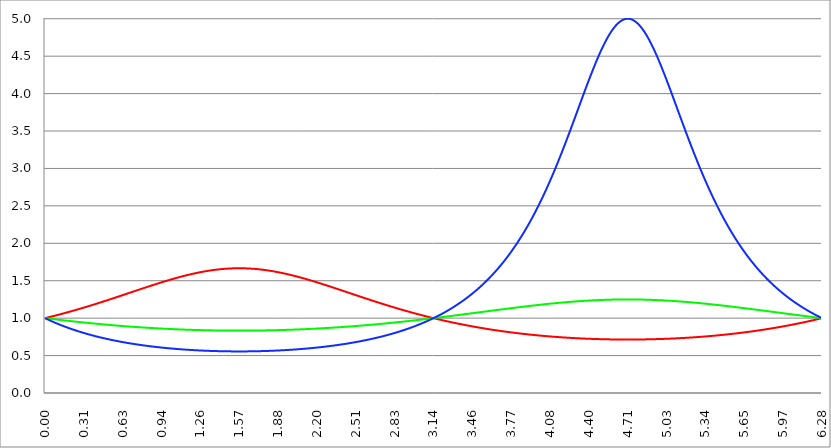
| Category | Series 1 | Series 0 | Series 2 |
|---|---|---|---|
| 0.0 | 1 | 1 | 1 |
| 0.00314159265358979 | 1.001 | 0.999 | 0.997 |
| 0.00628318530717958 | 1.003 | 0.999 | 0.995 |
| 0.00942477796076938 | 1.004 | 0.998 | 0.993 |
| 0.0125663706143592 | 1.005 | 0.997 | 0.99 |
| 0.015707963267949 | 1.006 | 0.997 | 0.988 |
| 0.0188495559215388 | 1.008 | 0.996 | 0.985 |
| 0.0219911485751285 | 1.009 | 0.996 | 0.983 |
| 0.0251327412287183 | 1.01 | 0.995 | 0.98 |
| 0.0282743338823081 | 1.011 | 0.994 | 0.978 |
| 0.0314159265358979 | 1.013 | 0.994 | 0.975 |
| 0.0345575191894877 | 1.014 | 0.993 | 0.973 |
| 0.0376991118430775 | 1.015 | 0.993 | 0.971 |
| 0.0408407044966673 | 1.017 | 0.992 | 0.968 |
| 0.0439822971502571 | 1.018 | 0.991 | 0.966 |
| 0.0471238898038469 | 1.019 | 0.991 | 0.964 |
| 0.0502654824574367 | 1.021 | 0.99 | 0.961 |
| 0.0534070751110265 | 1.022 | 0.989 | 0.959 |
| 0.0565486677646163 | 1.023 | 0.989 | 0.957 |
| 0.059690260418206 | 1.024 | 0.988 | 0.954 |
| 0.0628318530717958 | 1.026 | 0.988 | 0.952 |
| 0.0659734457253856 | 1.027 | 0.987 | 0.95 |
| 0.0691150383789754 | 1.028 | 0.986 | 0.948 |
| 0.0722566310325652 | 1.03 | 0.986 | 0.945 |
| 0.075398223686155 | 1.031 | 0.985 | 0.943 |
| 0.0785398163397448 | 1.032 | 0.985 | 0.941 |
| 0.0816814089933346 | 1.034 | 0.984 | 0.939 |
| 0.0848230016469244 | 1.035 | 0.983 | 0.937 |
| 0.0879645943005142 | 1.036 | 0.983 | 0.934 |
| 0.091106186954104 | 1.038 | 0.982 | 0.932 |
| 0.0942477796076937 | 1.039 | 0.982 | 0.93 |
| 0.0973893722612835 | 1.04 | 0.981 | 0.928 |
| 0.100530964914873 | 1.042 | 0.98 | 0.926 |
| 0.103672557568463 | 1.043 | 0.98 | 0.924 |
| 0.106814150222053 | 1.045 | 0.979 | 0.921 |
| 0.109955742875643 | 1.046 | 0.979 | 0.919 |
| 0.113097335529233 | 1.047 | 0.978 | 0.917 |
| 0.116238928182822 | 1.049 | 0.977 | 0.915 |
| 0.119380520836412 | 1.05 | 0.977 | 0.913 |
| 0.122522113490002 | 1.051 | 0.976 | 0.911 |
| 0.125663706143592 | 1.053 | 0.976 | 0.909 |
| 0.128805298797181 | 1.054 | 0.975 | 0.907 |
| 0.131946891450771 | 1.056 | 0.974 | 0.905 |
| 0.135088484104361 | 1.057 | 0.974 | 0.903 |
| 0.138230076757951 | 1.058 | 0.973 | 0.901 |
| 0.141371669411541 | 1.06 | 0.973 | 0.899 |
| 0.14451326206513 | 1.061 | 0.972 | 0.897 |
| 0.14765485471872 | 1.063 | 0.971 | 0.895 |
| 0.15079644737231 | 1.064 | 0.971 | 0.893 |
| 0.1539380400259 | 1.065 | 0.97 | 0.891 |
| 0.15707963267949 | 1.067 | 0.97 | 0.889 |
| 0.160221225333079 | 1.068 | 0.969 | 0.887 |
| 0.163362817986669 | 1.07 | 0.968 | 0.885 |
| 0.166504410640259 | 1.071 | 0.968 | 0.883 |
| 0.169646003293849 | 1.072 | 0.967 | 0.881 |
| 0.172787595947439 | 1.074 | 0.967 | 0.879 |
| 0.175929188601028 | 1.075 | 0.966 | 0.877 |
| 0.179070781254618 | 1.077 | 0.966 | 0.875 |
| 0.182212373908208 | 1.078 | 0.965 | 0.873 |
| 0.185353966561798 | 1.08 | 0.964 | 0.872 |
| 0.188495559215388 | 1.081 | 0.964 | 0.87 |
| 0.191637151868977 | 1.082 | 0.963 | 0.868 |
| 0.194778744522567 | 1.084 | 0.963 | 0.866 |
| 0.197920337176157 | 1.085 | 0.962 | 0.864 |
| 0.201061929829747 | 1.087 | 0.962 | 0.862 |
| 0.204203522483336 | 1.088 | 0.961 | 0.86 |
| 0.207345115136926 | 1.09 | 0.96 | 0.859 |
| 0.210486707790516 | 1.091 | 0.96 | 0.857 |
| 0.213628300444106 | 1.093 | 0.959 | 0.855 |
| 0.216769893097696 | 1.094 | 0.959 | 0.853 |
| 0.219911485751285 | 1.096 | 0.958 | 0.851 |
| 0.223053078404875 | 1.097 | 0.958 | 0.85 |
| 0.226194671058465 | 1.099 | 0.957 | 0.848 |
| 0.229336263712055 | 1.1 | 0.957 | 0.846 |
| 0.232477856365645 | 1.102 | 0.956 | 0.844 |
| 0.235619449019234 | 1.103 | 0.955 | 0.843 |
| 0.238761041672824 | 1.104 | 0.955 | 0.841 |
| 0.241902634326414 | 1.106 | 0.954 | 0.839 |
| 0.245044226980004 | 1.107 | 0.954 | 0.837 |
| 0.248185819633594 | 1.109 | 0.953 | 0.836 |
| 0.251327412287183 | 1.11 | 0.953 | 0.834 |
| 0.254469004940773 | 1.112 | 0.952 | 0.832 |
| 0.257610597594363 | 1.113 | 0.952 | 0.831 |
| 0.260752190247953 | 1.115 | 0.951 | 0.829 |
| 0.263893782901543 | 1.116 | 0.95 | 0.827 |
| 0.267035375555132 | 1.118 | 0.95 | 0.826 |
| 0.270176968208722 | 1.12 | 0.949 | 0.824 |
| 0.273318560862312 | 1.121 | 0.949 | 0.822 |
| 0.276460153515902 | 1.123 | 0.948 | 0.821 |
| 0.279601746169492 | 1.124 | 0.948 | 0.819 |
| 0.282743338823082 | 1.126 | 0.947 | 0.818 |
| 0.285884931476671 | 1.127 | 0.947 | 0.816 |
| 0.289026524130261 | 1.129 | 0.946 | 0.814 |
| 0.292168116783851 | 1.13 | 0.946 | 0.813 |
| 0.295309709437441 | 1.132 | 0.945 | 0.811 |
| 0.298451302091031 | 1.133 | 0.944 | 0.81 |
| 0.30159289474462 | 1.135 | 0.944 | 0.808 |
| 0.30473448739821 | 1.136 | 0.943 | 0.806 |
| 0.3078760800518 | 1.138 | 0.943 | 0.805 |
| 0.31101767270539 | 1.139 | 0.942 | 0.803 |
| 0.31415926535898 | 1.141 | 0.942 | 0.802 |
| 0.31730085801257 | 1.143 | 0.941 | 0.8 |
| 0.320442450666159 | 1.144 | 0.941 | 0.799 |
| 0.323584043319749 | 1.146 | 0.94 | 0.797 |
| 0.326725635973339 | 1.147 | 0.94 | 0.796 |
| 0.329867228626929 | 1.149 | 0.939 | 0.794 |
| 0.333008821280519 | 1.15 | 0.939 | 0.793 |
| 0.336150413934108 | 1.152 | 0.938 | 0.791 |
| 0.339292006587698 | 1.154 | 0.938 | 0.79 |
| 0.342433599241288 | 1.155 | 0.937 | 0.788 |
| 0.345575191894878 | 1.157 | 0.937 | 0.787 |
| 0.348716784548468 | 1.158 | 0.936 | 0.785 |
| 0.351858377202058 | 1.16 | 0.936 | 0.784 |
| 0.354999969855647 | 1.161 | 0.935 | 0.782 |
| 0.358141562509237 | 1.163 | 0.934 | 0.781 |
| 0.361283155162827 | 1.165 | 0.934 | 0.78 |
| 0.364424747816417 | 1.166 | 0.933 | 0.778 |
| 0.367566340470007 | 1.168 | 0.933 | 0.777 |
| 0.370707933123597 | 1.169 | 0.932 | 0.775 |
| 0.373849525777186 | 1.171 | 0.932 | 0.774 |
| 0.376991118430776 | 1.173 | 0.931 | 0.772 |
| 0.380132711084366 | 1.174 | 0.931 | 0.771 |
| 0.383274303737956 | 1.176 | 0.93 | 0.77 |
| 0.386415896391546 | 1.178 | 0.93 | 0.768 |
| 0.389557489045135 | 1.179 | 0.929 | 0.767 |
| 0.392699081698725 | 1.181 | 0.929 | 0.766 |
| 0.395840674352315 | 1.182 | 0.928 | 0.764 |
| 0.398982267005905 | 1.184 | 0.928 | 0.763 |
| 0.402123859659495 | 1.186 | 0.927 | 0.762 |
| 0.405265452313085 | 1.187 | 0.927 | 0.76 |
| 0.408407044966674 | 1.189 | 0.926 | 0.759 |
| 0.411548637620264 | 1.19 | 0.926 | 0.758 |
| 0.414690230273854 | 1.192 | 0.925 | 0.756 |
| 0.417831822927444 | 1.194 | 0.925 | 0.755 |
| 0.420973415581034 | 1.195 | 0.924 | 0.754 |
| 0.424115008234623 | 1.197 | 0.924 | 0.752 |
| 0.427256600888213 | 1.199 | 0.923 | 0.751 |
| 0.430398193541803 | 1.2 | 0.923 | 0.75 |
| 0.433539786195393 | 1.202 | 0.922 | 0.748 |
| 0.436681378848983 | 1.204 | 0.922 | 0.747 |
| 0.439822971502573 | 1.205 | 0.922 | 0.746 |
| 0.442964564156162 | 1.207 | 0.921 | 0.745 |
| 0.446106156809752 | 1.209 | 0.921 | 0.743 |
| 0.449247749463342 | 1.21 | 0.92 | 0.742 |
| 0.452389342116932 | 1.212 | 0.92 | 0.741 |
| 0.455530934770522 | 1.214 | 0.919 | 0.74 |
| 0.458672527424111 | 1.215 | 0.919 | 0.738 |
| 0.461814120077701 | 1.217 | 0.918 | 0.737 |
| 0.464955712731291 | 1.219 | 0.918 | 0.736 |
| 0.468097305384881 | 1.22 | 0.917 | 0.735 |
| 0.471238898038471 | 1.222 | 0.917 | 0.734 |
| 0.474380490692061 | 1.224 | 0.916 | 0.732 |
| 0.47752208334565 | 1.225 | 0.916 | 0.731 |
| 0.48066367599924 | 1.227 | 0.915 | 0.73 |
| 0.48380526865283 | 1.229 | 0.915 | 0.729 |
| 0.48694686130642 | 1.23 | 0.914 | 0.728 |
| 0.49008845396001 | 1.232 | 0.914 | 0.726 |
| 0.493230046613599 | 1.234 | 0.913 | 0.725 |
| 0.496371639267189 | 1.235 | 0.913 | 0.724 |
| 0.499513231920779 | 1.237 | 0.913 | 0.723 |
| 0.502654824574369 | 1.239 | 0.912 | 0.722 |
| 0.505796417227959 | 1.24 | 0.912 | 0.721 |
| 0.508938009881549 | 1.242 | 0.911 | 0.72 |
| 0.512079602535138 | 1.244 | 0.911 | 0.718 |
| 0.515221195188728 | 1.245 | 0.91 | 0.717 |
| 0.518362787842318 | 1.247 | 0.91 | 0.716 |
| 0.521504380495908 | 1.249 | 0.909 | 0.715 |
| 0.524645973149498 | 1.251 | 0.909 | 0.714 |
| 0.527787565803087 | 1.252 | 0.908 | 0.713 |
| 0.530929158456677 | 1.254 | 0.908 | 0.712 |
| 0.534070751110267 | 1.256 | 0.908 | 0.711 |
| 0.537212343763857 | 1.257 | 0.907 | 0.71 |
| 0.540353936417447 | 1.259 | 0.907 | 0.708 |
| 0.543495529071037 | 1.261 | 0.906 | 0.707 |
| 0.546637121724626 | 1.263 | 0.906 | 0.706 |
| 0.549778714378216 | 1.264 | 0.905 | 0.705 |
| 0.552920307031806 | 1.266 | 0.905 | 0.704 |
| 0.556061899685396 | 1.268 | 0.905 | 0.703 |
| 0.559203492338986 | 1.269 | 0.904 | 0.702 |
| 0.562345084992576 | 1.271 | 0.904 | 0.701 |
| 0.565486677646165 | 1.273 | 0.903 | 0.7 |
| 0.568628270299755 | 1.275 | 0.903 | 0.699 |
| 0.571769862953345 | 1.276 | 0.902 | 0.698 |
| 0.574911455606935 | 1.278 | 0.902 | 0.697 |
| 0.578053048260525 | 1.28 | 0.901 | 0.696 |
| 0.581194640914114 | 1.281 | 0.901 | 0.695 |
| 0.584336233567704 | 1.283 | 0.901 | 0.694 |
| 0.587477826221294 | 1.285 | 0.9 | 0.693 |
| 0.590619418874884 | 1.287 | 0.9 | 0.692 |
| 0.593761011528474 | 1.288 | 0.899 | 0.691 |
| 0.596902604182064 | 1.29 | 0.899 | 0.69 |
| 0.600044196835653 | 1.292 | 0.899 | 0.689 |
| 0.603185789489243 | 1.294 | 0.898 | 0.688 |
| 0.606327382142833 | 1.295 | 0.898 | 0.687 |
| 0.609468974796423 | 1.297 | 0.897 | 0.686 |
| 0.612610567450013 | 1.299 | 0.897 | 0.685 |
| 0.615752160103602 | 1.3 | 0.896 | 0.684 |
| 0.618893752757192 | 1.302 | 0.896 | 0.683 |
| 0.622035345410782 | 1.304 | 0.896 | 0.682 |
| 0.625176938064372 | 1.306 | 0.895 | 0.681 |
| 0.628318530717962 | 1.307 | 0.895 | 0.68 |
| 0.631460123371551 | 1.309 | 0.894 | 0.679 |
| 0.634601716025141 | 1.311 | 0.894 | 0.678 |
| 0.637743308678731 | 1.313 | 0.894 | 0.677 |
| 0.640884901332321 | 1.314 | 0.893 | 0.676 |
| 0.644026493985911 | 1.316 | 0.893 | 0.676 |
| 0.647168086639501 | 1.318 | 0.892 | 0.675 |
| 0.65030967929309 | 1.32 | 0.892 | 0.674 |
| 0.65345127194668 | 1.321 | 0.892 | 0.673 |
| 0.65659286460027 | 1.323 | 0.891 | 0.672 |
| 0.65973445725386 | 1.325 | 0.891 | 0.671 |
| 0.66287604990745 | 1.327 | 0.89 | 0.67 |
| 0.666017642561039 | 1.328 | 0.89 | 0.669 |
| 0.669159235214629 | 1.33 | 0.89 | 0.668 |
| 0.672300827868219 | 1.332 | 0.889 | 0.667 |
| 0.675442420521809 | 1.334 | 0.889 | 0.667 |
| 0.678584013175399 | 1.335 | 0.888 | 0.666 |
| 0.681725605828989 | 1.337 | 0.888 | 0.665 |
| 0.684867198482578 | 1.339 | 0.888 | 0.664 |
| 0.688008791136168 | 1.34 | 0.887 | 0.663 |
| 0.691150383789758 | 1.342 | 0.887 | 0.662 |
| 0.694291976443348 | 1.344 | 0.887 | 0.661 |
| 0.697433569096938 | 1.346 | 0.886 | 0.661 |
| 0.700575161750528 | 1.347 | 0.886 | 0.66 |
| 0.703716754404117 | 1.349 | 0.885 | 0.659 |
| 0.706858347057707 | 1.351 | 0.885 | 0.658 |
| 0.709999939711297 | 1.353 | 0.885 | 0.657 |
| 0.713141532364887 | 1.354 | 0.884 | 0.656 |
| 0.716283125018477 | 1.356 | 0.884 | 0.656 |
| 0.719424717672066 | 1.358 | 0.884 | 0.655 |
| 0.722566310325656 | 1.36 | 0.883 | 0.654 |
| 0.725707902979246 | 1.361 | 0.883 | 0.653 |
| 0.728849495632836 | 1.363 | 0.882 | 0.652 |
| 0.731991088286426 | 1.365 | 0.882 | 0.652 |
| 0.735132680940016 | 1.367 | 0.882 | 0.651 |
| 0.738274273593605 | 1.368 | 0.881 | 0.65 |
| 0.741415866247195 | 1.37 | 0.881 | 0.649 |
| 0.744557458900785 | 1.372 | 0.881 | 0.648 |
| 0.747699051554375 | 1.374 | 0.88 | 0.648 |
| 0.750840644207965 | 1.375 | 0.88 | 0.647 |
| 0.753982236861554 | 1.377 | 0.88 | 0.646 |
| 0.757123829515144 | 1.379 | 0.879 | 0.645 |
| 0.760265422168734 | 1.381 | 0.879 | 0.645 |
| 0.763407014822324 | 1.382 | 0.879 | 0.644 |
| 0.766548607475914 | 1.384 | 0.878 | 0.643 |
| 0.769690200129504 | 1.386 | 0.878 | 0.642 |
| 0.772831792783093 | 1.387 | 0.877 | 0.642 |
| 0.775973385436683 | 1.389 | 0.877 | 0.641 |
| 0.779114978090273 | 1.391 | 0.877 | 0.64 |
| 0.782256570743863 | 1.393 | 0.876 | 0.639 |
| 0.785398163397453 | 1.394 | 0.876 | 0.639 |
| 0.788539756051042 | 1.396 | 0.876 | 0.638 |
| 0.791681348704632 | 1.398 | 0.875 | 0.637 |
| 0.794822941358222 | 1.4 | 0.875 | 0.637 |
| 0.797964534011812 | 1.401 | 0.875 | 0.636 |
| 0.801106126665402 | 1.403 | 0.874 | 0.635 |
| 0.804247719318992 | 1.405 | 0.874 | 0.634 |
| 0.807389311972581 | 1.406 | 0.874 | 0.634 |
| 0.810530904626171 | 1.408 | 0.873 | 0.633 |
| 0.813672497279761 | 1.41 | 0.873 | 0.632 |
| 0.816814089933351 | 1.412 | 0.873 | 0.632 |
| 0.819955682586941 | 1.413 | 0.872 | 0.631 |
| 0.823097275240531 | 1.415 | 0.872 | 0.63 |
| 0.82623886789412 | 1.417 | 0.872 | 0.63 |
| 0.82938046054771 | 1.418 | 0.871 | 0.629 |
| 0.8325220532013 | 1.42 | 0.871 | 0.628 |
| 0.83566364585489 | 1.422 | 0.871 | 0.628 |
| 0.83880523850848 | 1.424 | 0.87 | 0.627 |
| 0.841946831162069 | 1.425 | 0.87 | 0.626 |
| 0.845088423815659 | 1.427 | 0.87 | 0.626 |
| 0.848230016469249 | 1.429 | 0.87 | 0.625 |
| 0.851371609122839 | 1.43 | 0.869 | 0.624 |
| 0.854513201776429 | 1.432 | 0.869 | 0.624 |
| 0.857654794430019 | 1.434 | 0.869 | 0.623 |
| 0.860796387083608 | 1.435 | 0.868 | 0.622 |
| 0.863937979737198 | 1.437 | 0.868 | 0.622 |
| 0.867079572390788 | 1.439 | 0.868 | 0.621 |
| 0.870221165044378 | 1.44 | 0.867 | 0.621 |
| 0.873362757697968 | 1.442 | 0.867 | 0.62 |
| 0.876504350351557 | 1.444 | 0.867 | 0.619 |
| 0.879645943005147 | 1.446 | 0.866 | 0.619 |
| 0.882787535658737 | 1.447 | 0.866 | 0.618 |
| 0.885929128312327 | 1.449 | 0.866 | 0.617 |
| 0.889070720965917 | 1.451 | 0.866 | 0.617 |
| 0.892212313619507 | 1.452 | 0.865 | 0.616 |
| 0.895353906273096 | 1.454 | 0.865 | 0.616 |
| 0.898495498926686 | 1.456 | 0.865 | 0.615 |
| 0.901637091580276 | 1.457 | 0.864 | 0.614 |
| 0.904778684233866 | 1.459 | 0.864 | 0.614 |
| 0.907920276887456 | 1.46 | 0.864 | 0.613 |
| 0.911061869541045 | 1.462 | 0.864 | 0.613 |
| 0.914203462194635 | 1.464 | 0.863 | 0.612 |
| 0.917345054848225 | 1.465 | 0.863 | 0.612 |
| 0.920486647501815 | 1.467 | 0.863 | 0.611 |
| 0.923628240155405 | 1.469 | 0.862 | 0.61 |
| 0.926769832808995 | 1.47 | 0.862 | 0.61 |
| 0.929911425462584 | 1.472 | 0.862 | 0.609 |
| 0.933053018116174 | 1.474 | 0.862 | 0.609 |
| 0.936194610769764 | 1.475 | 0.861 | 0.608 |
| 0.939336203423354 | 1.477 | 0.861 | 0.608 |
| 0.942477796076944 | 1.478 | 0.861 | 0.607 |
| 0.945619388730533 | 1.48 | 0.86 | 0.607 |
| 0.948760981384123 | 1.482 | 0.86 | 0.606 |
| 0.951902574037713 | 1.483 | 0.86 | 0.605 |
| 0.955044166691303 | 1.485 | 0.86 | 0.605 |
| 0.958185759344893 | 1.486 | 0.859 | 0.604 |
| 0.961327351998483 | 1.488 | 0.859 | 0.604 |
| 0.964468944652072 | 1.49 | 0.859 | 0.603 |
| 0.967610537305662 | 1.491 | 0.859 | 0.603 |
| 0.970752129959252 | 1.493 | 0.858 | 0.602 |
| 0.973893722612842 | 1.494 | 0.858 | 0.602 |
| 0.977035315266432 | 1.496 | 0.858 | 0.601 |
| 0.980176907920022 | 1.498 | 0.858 | 0.601 |
| 0.983318500573611 | 1.499 | 0.857 | 0.6 |
| 0.986460093227201 | 1.501 | 0.857 | 0.6 |
| 0.989601685880791 | 1.502 | 0.857 | 0.599 |
| 0.992743278534381 | 1.504 | 0.857 | 0.599 |
| 0.995884871187971 | 1.505 | 0.856 | 0.598 |
| 0.99902646384156 | 1.507 | 0.856 | 0.598 |
| 1.00216805649515 | 1.508 | 0.856 | 0.597 |
| 1.00530964914874 | 1.51 | 0.856 | 0.597 |
| 1.00845124180233 | 1.511 | 0.855 | 0.596 |
| 1.01159283445592 | 1.513 | 0.855 | 0.596 |
| 1.01473442710951 | 1.515 | 0.855 | 0.595 |
| 1.017876019763099 | 1.516 | 0.855 | 0.595 |
| 1.021017612416689 | 1.518 | 0.854 | 0.594 |
| 1.02415920507028 | 1.519 | 0.854 | 0.594 |
| 1.027300797723869 | 1.521 | 0.854 | 0.594 |
| 1.030442390377459 | 1.522 | 0.854 | 0.593 |
| 1.033583983031048 | 1.524 | 0.853 | 0.593 |
| 1.036725575684638 | 1.525 | 0.853 | 0.592 |
| 1.039867168338228 | 1.527 | 0.853 | 0.592 |
| 1.043008760991818 | 1.528 | 0.853 | 0.591 |
| 1.046150353645408 | 1.53 | 0.852 | 0.591 |
| 1.049291946298998 | 1.531 | 0.852 | 0.59 |
| 1.052433538952587 | 1.532 | 0.852 | 0.59 |
| 1.055575131606177 | 1.534 | 0.852 | 0.59 |
| 1.058716724259767 | 1.535 | 0.852 | 0.589 |
| 1.061858316913357 | 1.537 | 0.851 | 0.589 |
| 1.064999909566947 | 1.538 | 0.851 | 0.588 |
| 1.068141502220536 | 1.54 | 0.851 | 0.588 |
| 1.071283094874126 | 1.541 | 0.851 | 0.587 |
| 1.074424687527716 | 1.543 | 0.85 | 0.587 |
| 1.077566280181306 | 1.544 | 0.85 | 0.587 |
| 1.080707872834896 | 1.545 | 0.85 | 0.586 |
| 1.083849465488486 | 1.547 | 0.85 | 0.586 |
| 1.086991058142075 | 1.548 | 0.85 | 0.585 |
| 1.090132650795665 | 1.55 | 0.849 | 0.585 |
| 1.093274243449255 | 1.551 | 0.849 | 0.585 |
| 1.096415836102845 | 1.552 | 0.849 | 0.584 |
| 1.099557428756435 | 1.554 | 0.849 | 0.584 |
| 1.102699021410025 | 1.555 | 0.849 | 0.583 |
| 1.105840614063614 | 1.557 | 0.848 | 0.583 |
| 1.108982206717204 | 1.558 | 0.848 | 0.583 |
| 1.112123799370794 | 1.559 | 0.848 | 0.582 |
| 1.115265392024384 | 1.561 | 0.848 | 0.582 |
| 1.118406984677974 | 1.562 | 0.848 | 0.582 |
| 1.121548577331563 | 1.563 | 0.847 | 0.581 |
| 1.124690169985153 | 1.565 | 0.847 | 0.581 |
| 1.127831762638743 | 1.566 | 0.847 | 0.58 |
| 1.130973355292333 | 1.567 | 0.847 | 0.58 |
| 1.134114947945923 | 1.569 | 0.847 | 0.58 |
| 1.137256540599513 | 1.57 | 0.846 | 0.579 |
| 1.140398133253102 | 1.571 | 0.846 | 0.579 |
| 1.143539725906692 | 1.572 | 0.846 | 0.579 |
| 1.146681318560282 | 1.574 | 0.846 | 0.578 |
| 1.149822911213872 | 1.575 | 0.846 | 0.578 |
| 1.152964503867462 | 1.576 | 0.845 | 0.578 |
| 1.156106096521051 | 1.578 | 0.845 | 0.577 |
| 1.159247689174641 | 1.579 | 0.845 | 0.577 |
| 1.162389281828231 | 1.58 | 0.845 | 0.577 |
| 1.165530874481821 | 1.581 | 0.845 | 0.576 |
| 1.168672467135411 | 1.583 | 0.845 | 0.576 |
| 1.171814059789001 | 1.584 | 0.844 | 0.576 |
| 1.17495565244259 | 1.585 | 0.844 | 0.575 |
| 1.17809724509618 | 1.586 | 0.844 | 0.575 |
| 1.18123883774977 | 1.587 | 0.844 | 0.575 |
| 1.18438043040336 | 1.589 | 0.844 | 0.574 |
| 1.18752202305695 | 1.59 | 0.844 | 0.574 |
| 1.190663615710539 | 1.591 | 0.843 | 0.574 |
| 1.193805208364129 | 1.592 | 0.843 | 0.573 |
| 1.19694680101772 | 1.593 | 0.843 | 0.573 |
| 1.200088393671309 | 1.594 | 0.843 | 0.573 |
| 1.203229986324899 | 1.596 | 0.843 | 0.573 |
| 1.206371578978489 | 1.597 | 0.843 | 0.572 |
| 1.209513171632078 | 1.598 | 0.842 | 0.572 |
| 1.212654764285668 | 1.599 | 0.842 | 0.572 |
| 1.215796356939258 | 1.6 | 0.842 | 0.571 |
| 1.218937949592848 | 1.601 | 0.842 | 0.571 |
| 1.222079542246438 | 1.602 | 0.842 | 0.571 |
| 1.225221134900027 | 1.603 | 0.842 | 0.571 |
| 1.228362727553617 | 1.605 | 0.841 | 0.57 |
| 1.231504320207207 | 1.606 | 0.841 | 0.57 |
| 1.234645912860797 | 1.607 | 0.841 | 0.57 |
| 1.237787505514387 | 1.608 | 0.841 | 0.569 |
| 1.240929098167977 | 1.609 | 0.841 | 0.569 |
| 1.244070690821566 | 1.61 | 0.841 | 0.569 |
| 1.247212283475156 | 1.611 | 0.841 | 0.569 |
| 1.250353876128746 | 1.612 | 0.84 | 0.568 |
| 1.253495468782336 | 1.613 | 0.84 | 0.568 |
| 1.256637061435926 | 1.614 | 0.84 | 0.568 |
| 1.259778654089515 | 1.615 | 0.84 | 0.568 |
| 1.262920246743105 | 1.616 | 0.84 | 0.567 |
| 1.266061839396695 | 1.617 | 0.84 | 0.567 |
| 1.269203432050285 | 1.618 | 0.84 | 0.567 |
| 1.272345024703875 | 1.619 | 0.84 | 0.567 |
| 1.275486617357465 | 1.62 | 0.839 | 0.566 |
| 1.278628210011054 | 1.621 | 0.839 | 0.566 |
| 1.281769802664644 | 1.622 | 0.839 | 0.566 |
| 1.284911395318234 | 1.623 | 0.839 | 0.566 |
| 1.288052987971824 | 1.624 | 0.839 | 0.566 |
| 1.291194580625414 | 1.625 | 0.839 | 0.565 |
| 1.294336173279003 | 1.626 | 0.839 | 0.565 |
| 1.297477765932593 | 1.626 | 0.839 | 0.565 |
| 1.300619358586183 | 1.627 | 0.838 | 0.565 |
| 1.303760951239773 | 1.628 | 0.838 | 0.564 |
| 1.306902543893363 | 1.629 | 0.838 | 0.564 |
| 1.310044136546953 | 1.63 | 0.838 | 0.564 |
| 1.313185729200542 | 1.631 | 0.838 | 0.564 |
| 1.316327321854132 | 1.632 | 0.838 | 0.564 |
| 1.319468914507722 | 1.632 | 0.838 | 0.563 |
| 1.322610507161312 | 1.633 | 0.838 | 0.563 |
| 1.325752099814902 | 1.634 | 0.838 | 0.563 |
| 1.328893692468491 | 1.635 | 0.837 | 0.563 |
| 1.332035285122081 | 1.636 | 0.837 | 0.563 |
| 1.335176877775671 | 1.637 | 0.837 | 0.562 |
| 1.338318470429261 | 1.637 | 0.837 | 0.562 |
| 1.341460063082851 | 1.638 | 0.837 | 0.562 |
| 1.344601655736441 | 1.639 | 0.837 | 0.562 |
| 1.34774324839003 | 1.64 | 0.837 | 0.562 |
| 1.35088484104362 | 1.64 | 0.837 | 0.562 |
| 1.35402643369721 | 1.641 | 0.837 | 0.561 |
| 1.3571680263508 | 1.642 | 0.837 | 0.561 |
| 1.36030961900439 | 1.642 | 0.836 | 0.561 |
| 1.363451211657979 | 1.643 | 0.836 | 0.561 |
| 1.36659280431157 | 1.644 | 0.836 | 0.561 |
| 1.369734396965159 | 1.645 | 0.836 | 0.561 |
| 1.372875989618749 | 1.645 | 0.836 | 0.56 |
| 1.376017582272339 | 1.646 | 0.836 | 0.56 |
| 1.379159174925929 | 1.647 | 0.836 | 0.56 |
| 1.382300767579518 | 1.647 | 0.836 | 0.56 |
| 1.385442360233108 | 1.648 | 0.836 | 0.56 |
| 1.388583952886698 | 1.648 | 0.836 | 0.56 |
| 1.391725545540288 | 1.649 | 0.836 | 0.56 |
| 1.394867138193878 | 1.65 | 0.835 | 0.559 |
| 1.398008730847468 | 1.65 | 0.835 | 0.559 |
| 1.401150323501057 | 1.651 | 0.835 | 0.559 |
| 1.404291916154647 | 1.651 | 0.835 | 0.559 |
| 1.407433508808237 | 1.652 | 0.835 | 0.559 |
| 1.410575101461827 | 1.653 | 0.835 | 0.559 |
| 1.413716694115417 | 1.653 | 0.835 | 0.559 |
| 1.416858286769006 | 1.654 | 0.835 | 0.558 |
| 1.419999879422596 | 1.654 | 0.835 | 0.558 |
| 1.423141472076186 | 1.655 | 0.835 | 0.558 |
| 1.426283064729776 | 1.655 | 0.835 | 0.558 |
| 1.429424657383366 | 1.656 | 0.835 | 0.558 |
| 1.432566250036956 | 1.656 | 0.835 | 0.558 |
| 1.435707842690545 | 1.657 | 0.835 | 0.558 |
| 1.438849435344135 | 1.657 | 0.835 | 0.558 |
| 1.441991027997725 | 1.658 | 0.834 | 0.558 |
| 1.445132620651315 | 1.658 | 0.834 | 0.558 |
| 1.448274213304905 | 1.658 | 0.834 | 0.557 |
| 1.451415805958494 | 1.659 | 0.834 | 0.557 |
| 1.454557398612084 | 1.659 | 0.834 | 0.557 |
| 1.457698991265674 | 1.66 | 0.834 | 0.557 |
| 1.460840583919264 | 1.66 | 0.834 | 0.557 |
| 1.463982176572854 | 1.66 | 0.834 | 0.557 |
| 1.467123769226444 | 1.661 | 0.834 | 0.557 |
| 1.470265361880033 | 1.661 | 0.834 | 0.557 |
| 1.473406954533623 | 1.661 | 0.834 | 0.557 |
| 1.476548547187213 | 1.662 | 0.834 | 0.557 |
| 1.479690139840803 | 1.662 | 0.834 | 0.557 |
| 1.482831732494393 | 1.662 | 0.834 | 0.557 |
| 1.485973325147982 | 1.663 | 0.834 | 0.556 |
| 1.489114917801572 | 1.663 | 0.834 | 0.556 |
| 1.492256510455162 | 1.663 | 0.834 | 0.556 |
| 1.495398103108752 | 1.664 | 0.834 | 0.556 |
| 1.498539695762342 | 1.664 | 0.834 | 0.556 |
| 1.501681288415932 | 1.664 | 0.834 | 0.556 |
| 1.504822881069521 | 1.664 | 0.834 | 0.556 |
| 1.507964473723111 | 1.664 | 0.834 | 0.556 |
| 1.511106066376701 | 1.665 | 0.834 | 0.556 |
| 1.514247659030291 | 1.665 | 0.834 | 0.556 |
| 1.517389251683881 | 1.665 | 0.834 | 0.556 |
| 1.520530844337471 | 1.665 | 0.834 | 0.556 |
| 1.52367243699106 | 1.665 | 0.833 | 0.556 |
| 1.52681402964465 | 1.666 | 0.833 | 0.556 |
| 1.52995562229824 | 1.666 | 0.833 | 0.556 |
| 1.53309721495183 | 1.666 | 0.833 | 0.556 |
| 1.53623880760542 | 1.666 | 0.833 | 0.556 |
| 1.539380400259009 | 1.666 | 0.833 | 0.556 |
| 1.542521992912599 | 1.666 | 0.833 | 0.556 |
| 1.545663585566189 | 1.666 | 0.833 | 0.556 |
| 1.548805178219779 | 1.666 | 0.833 | 0.556 |
| 1.551946770873369 | 1.666 | 0.833 | 0.556 |
| 1.555088363526959 | 1.667 | 0.833 | 0.556 |
| 1.558229956180548 | 1.667 | 0.833 | 0.556 |
| 1.561371548834138 | 1.667 | 0.833 | 0.556 |
| 1.564513141487728 | 1.667 | 0.833 | 0.556 |
| 1.567654734141318 | 1.667 | 0.833 | 0.556 |
| 1.570796326794908 | 1.667 | 0.833 | 0.556 |
| 1.573937919448497 | 1.667 | 0.833 | 0.556 |
| 1.577079512102087 | 1.667 | 0.833 | 0.556 |
| 1.580221104755677 | 1.667 | 0.833 | 0.556 |
| 1.583362697409267 | 1.667 | 0.833 | 0.556 |
| 1.586504290062857 | 1.667 | 0.833 | 0.556 |
| 1.589645882716447 | 1.666 | 0.833 | 0.556 |
| 1.592787475370036 | 1.666 | 0.833 | 0.556 |
| 1.595929068023626 | 1.666 | 0.833 | 0.556 |
| 1.599070660677216 | 1.666 | 0.833 | 0.556 |
| 1.602212253330806 | 1.666 | 0.833 | 0.556 |
| 1.605353845984396 | 1.666 | 0.833 | 0.556 |
| 1.608495438637985 | 1.666 | 0.833 | 0.556 |
| 1.611637031291575 | 1.666 | 0.833 | 0.556 |
| 1.614778623945165 | 1.666 | 0.833 | 0.556 |
| 1.617920216598755 | 1.665 | 0.833 | 0.556 |
| 1.621061809252345 | 1.665 | 0.834 | 0.556 |
| 1.624203401905935 | 1.665 | 0.834 | 0.556 |
| 1.627344994559524 | 1.665 | 0.834 | 0.556 |
| 1.630486587213114 | 1.665 | 0.834 | 0.556 |
| 1.633628179866704 | 1.664 | 0.834 | 0.556 |
| 1.636769772520294 | 1.664 | 0.834 | 0.556 |
| 1.639911365173884 | 1.664 | 0.834 | 0.556 |
| 1.643052957827473 | 1.664 | 0.834 | 0.556 |
| 1.646194550481063 | 1.664 | 0.834 | 0.556 |
| 1.649336143134653 | 1.663 | 0.834 | 0.556 |
| 1.652477735788243 | 1.663 | 0.834 | 0.556 |
| 1.655619328441833 | 1.663 | 0.834 | 0.556 |
| 1.658760921095423 | 1.662 | 0.834 | 0.557 |
| 1.661902513749012 | 1.662 | 0.834 | 0.557 |
| 1.665044106402602 | 1.662 | 0.834 | 0.557 |
| 1.668185699056192 | 1.661 | 0.834 | 0.557 |
| 1.671327291709782 | 1.661 | 0.834 | 0.557 |
| 1.674468884363372 | 1.661 | 0.834 | 0.557 |
| 1.677610477016961 | 1.66 | 0.834 | 0.557 |
| 1.680752069670551 | 1.66 | 0.834 | 0.557 |
| 1.683893662324141 | 1.66 | 0.834 | 0.557 |
| 1.687035254977731 | 1.659 | 0.834 | 0.557 |
| 1.690176847631321 | 1.659 | 0.834 | 0.557 |
| 1.693318440284911 | 1.658 | 0.834 | 0.557 |
| 1.6964600329385 | 1.658 | 0.834 | 0.558 |
| 1.69960162559209 | 1.658 | 0.834 | 0.558 |
| 1.70274321824568 | 1.657 | 0.835 | 0.558 |
| 1.70588481089927 | 1.657 | 0.835 | 0.558 |
| 1.70902640355286 | 1.656 | 0.835 | 0.558 |
| 1.712167996206449 | 1.656 | 0.835 | 0.558 |
| 1.715309588860039 | 1.655 | 0.835 | 0.558 |
| 1.71845118151363 | 1.655 | 0.835 | 0.558 |
| 1.721592774167219 | 1.654 | 0.835 | 0.558 |
| 1.724734366820809 | 1.654 | 0.835 | 0.558 |
| 1.727875959474399 | 1.653 | 0.835 | 0.559 |
| 1.731017552127988 | 1.653 | 0.835 | 0.559 |
| 1.734159144781578 | 1.652 | 0.835 | 0.559 |
| 1.737300737435168 | 1.651 | 0.835 | 0.559 |
| 1.740442330088758 | 1.651 | 0.835 | 0.559 |
| 1.743583922742348 | 1.65 | 0.835 | 0.559 |
| 1.746725515395937 | 1.65 | 0.835 | 0.559 |
| 1.749867108049527 | 1.649 | 0.836 | 0.56 |
| 1.753008700703117 | 1.648 | 0.836 | 0.56 |
| 1.756150293356707 | 1.648 | 0.836 | 0.56 |
| 1.759291886010297 | 1.647 | 0.836 | 0.56 |
| 1.762433478663887 | 1.647 | 0.836 | 0.56 |
| 1.765575071317476 | 1.646 | 0.836 | 0.56 |
| 1.768716663971066 | 1.645 | 0.836 | 0.56 |
| 1.771858256624656 | 1.645 | 0.836 | 0.561 |
| 1.774999849278246 | 1.644 | 0.836 | 0.561 |
| 1.778141441931836 | 1.643 | 0.836 | 0.561 |
| 1.781283034585426 | 1.642 | 0.836 | 0.561 |
| 1.784424627239015 | 1.642 | 0.837 | 0.561 |
| 1.787566219892605 | 1.641 | 0.837 | 0.561 |
| 1.790707812546195 | 1.64 | 0.837 | 0.562 |
| 1.793849405199785 | 1.64 | 0.837 | 0.562 |
| 1.796990997853375 | 1.639 | 0.837 | 0.562 |
| 1.800132590506964 | 1.638 | 0.837 | 0.562 |
| 1.803274183160554 | 1.637 | 0.837 | 0.562 |
| 1.806415775814144 | 1.637 | 0.837 | 0.562 |
| 1.809557368467734 | 1.636 | 0.837 | 0.563 |
| 1.812698961121324 | 1.635 | 0.837 | 0.563 |
| 1.815840553774914 | 1.634 | 0.838 | 0.563 |
| 1.818982146428503 | 1.633 | 0.838 | 0.563 |
| 1.822123739082093 | 1.632 | 0.838 | 0.563 |
| 1.825265331735683 | 1.632 | 0.838 | 0.564 |
| 1.828406924389273 | 1.631 | 0.838 | 0.564 |
| 1.831548517042863 | 1.63 | 0.838 | 0.564 |
| 1.834690109696452 | 1.629 | 0.838 | 0.564 |
| 1.837831702350042 | 1.628 | 0.838 | 0.564 |
| 1.840973295003632 | 1.627 | 0.838 | 0.565 |
| 1.844114887657222 | 1.626 | 0.839 | 0.565 |
| 1.847256480310812 | 1.626 | 0.839 | 0.565 |
| 1.850398072964402 | 1.625 | 0.839 | 0.565 |
| 1.853539665617991 | 1.624 | 0.839 | 0.566 |
| 1.856681258271581 | 1.623 | 0.839 | 0.566 |
| 1.859822850925171 | 1.622 | 0.839 | 0.566 |
| 1.862964443578761 | 1.621 | 0.839 | 0.566 |
| 1.866106036232351 | 1.62 | 0.839 | 0.566 |
| 1.86924762888594 | 1.619 | 0.84 | 0.567 |
| 1.87238922153953 | 1.618 | 0.84 | 0.567 |
| 1.87553081419312 | 1.617 | 0.84 | 0.567 |
| 1.87867240684671 | 1.616 | 0.84 | 0.567 |
| 1.8818139995003 | 1.615 | 0.84 | 0.568 |
| 1.88495559215389 | 1.614 | 0.84 | 0.568 |
| 1.888097184807479 | 1.613 | 0.84 | 0.568 |
| 1.891238777461069 | 1.612 | 0.84 | 0.568 |
| 1.89438037011466 | 1.611 | 0.841 | 0.569 |
| 1.897521962768249 | 1.61 | 0.841 | 0.569 |
| 1.900663555421839 | 1.609 | 0.841 | 0.569 |
| 1.903805148075429 | 1.608 | 0.841 | 0.569 |
| 1.906946740729018 | 1.607 | 0.841 | 0.57 |
| 1.910088333382608 | 1.606 | 0.841 | 0.57 |
| 1.913229926036198 | 1.605 | 0.841 | 0.57 |
| 1.916371518689788 | 1.603 | 0.842 | 0.571 |
| 1.919513111343378 | 1.602 | 0.842 | 0.571 |
| 1.922654703996967 | 1.601 | 0.842 | 0.571 |
| 1.925796296650557 | 1.6 | 0.842 | 0.571 |
| 1.928937889304147 | 1.599 | 0.842 | 0.572 |
| 1.932079481957737 | 1.598 | 0.842 | 0.572 |
| 1.935221074611327 | 1.597 | 0.843 | 0.572 |
| 1.938362667264917 | 1.596 | 0.843 | 0.573 |
| 1.941504259918506 | 1.594 | 0.843 | 0.573 |
| 1.944645852572096 | 1.593 | 0.843 | 0.573 |
| 1.947787445225686 | 1.592 | 0.843 | 0.573 |
| 1.950929037879276 | 1.591 | 0.843 | 0.574 |
| 1.954070630532866 | 1.59 | 0.844 | 0.574 |
| 1.957212223186455 | 1.589 | 0.844 | 0.574 |
| 1.960353815840045 | 1.587 | 0.844 | 0.575 |
| 1.963495408493635 | 1.586 | 0.844 | 0.575 |
| 1.966637001147225 | 1.585 | 0.844 | 0.575 |
| 1.969778593800815 | 1.584 | 0.844 | 0.576 |
| 1.972920186454405 | 1.583 | 0.845 | 0.576 |
| 1.976061779107994 | 1.581 | 0.845 | 0.576 |
| 1.979203371761584 | 1.58 | 0.845 | 0.577 |
| 1.982344964415174 | 1.579 | 0.845 | 0.577 |
| 1.985486557068764 | 1.578 | 0.845 | 0.577 |
| 1.988628149722354 | 1.576 | 0.845 | 0.578 |
| 1.991769742375943 | 1.575 | 0.846 | 0.578 |
| 1.994911335029533 | 1.574 | 0.846 | 0.578 |
| 1.998052927683123 | 1.572 | 0.846 | 0.579 |
| 2.001194520336712 | 1.571 | 0.846 | 0.579 |
| 2.004336112990302 | 1.57 | 0.846 | 0.579 |
| 2.007477705643892 | 1.569 | 0.847 | 0.58 |
| 2.010619298297482 | 1.567 | 0.847 | 0.58 |
| 2.013760890951071 | 1.566 | 0.847 | 0.58 |
| 2.016902483604661 | 1.565 | 0.847 | 0.581 |
| 2.02004407625825 | 1.563 | 0.847 | 0.581 |
| 2.02318566891184 | 1.562 | 0.848 | 0.582 |
| 2.02632726156543 | 1.561 | 0.848 | 0.582 |
| 2.029468854219019 | 1.559 | 0.848 | 0.582 |
| 2.032610446872609 | 1.558 | 0.848 | 0.583 |
| 2.035752039526198 | 1.557 | 0.848 | 0.583 |
| 2.038893632179788 | 1.555 | 0.849 | 0.583 |
| 2.042035224833378 | 1.554 | 0.849 | 0.584 |
| 2.045176817486967 | 1.552 | 0.849 | 0.584 |
| 2.048318410140557 | 1.551 | 0.849 | 0.585 |
| 2.051460002794146 | 1.55 | 0.849 | 0.585 |
| 2.054601595447736 | 1.548 | 0.85 | 0.585 |
| 2.057743188101325 | 1.547 | 0.85 | 0.586 |
| 2.060884780754915 | 1.545 | 0.85 | 0.586 |
| 2.064026373408505 | 1.544 | 0.85 | 0.587 |
| 2.067167966062094 | 1.543 | 0.85 | 0.587 |
| 2.070309558715684 | 1.541 | 0.851 | 0.587 |
| 2.073451151369273 | 1.54 | 0.851 | 0.588 |
| 2.076592744022863 | 1.538 | 0.851 | 0.588 |
| 2.079734336676452 | 1.537 | 0.851 | 0.589 |
| 2.082875929330042 | 1.535 | 0.852 | 0.589 |
| 2.086017521983632 | 1.534 | 0.852 | 0.59 |
| 2.089159114637221 | 1.532 | 0.852 | 0.59 |
| 2.092300707290811 | 1.531 | 0.852 | 0.59 |
| 2.095442299944401 | 1.53 | 0.852 | 0.591 |
| 2.09858389259799 | 1.528 | 0.853 | 0.591 |
| 2.10172548525158 | 1.527 | 0.853 | 0.592 |
| 2.104867077905169 | 1.525 | 0.853 | 0.592 |
| 2.108008670558759 | 1.524 | 0.853 | 0.593 |
| 2.111150263212349 | 1.522 | 0.854 | 0.593 |
| 2.114291855865938 | 1.521 | 0.854 | 0.594 |
| 2.117433448519528 | 1.519 | 0.854 | 0.594 |
| 2.120575041173117 | 1.518 | 0.854 | 0.594 |
| 2.123716633826707 | 1.516 | 0.855 | 0.595 |
| 2.126858226480297 | 1.515 | 0.855 | 0.595 |
| 2.129999819133886 | 1.513 | 0.855 | 0.596 |
| 2.133141411787476 | 1.511 | 0.855 | 0.596 |
| 2.136283004441065 | 1.51 | 0.856 | 0.597 |
| 2.139424597094655 | 1.508 | 0.856 | 0.597 |
| 2.142566189748245 | 1.507 | 0.856 | 0.598 |
| 2.145707782401834 | 1.505 | 0.856 | 0.598 |
| 2.148849375055424 | 1.504 | 0.857 | 0.599 |
| 2.151990967709013 | 1.502 | 0.857 | 0.599 |
| 2.155132560362603 | 1.501 | 0.857 | 0.6 |
| 2.158274153016193 | 1.499 | 0.857 | 0.6 |
| 2.161415745669782 | 1.498 | 0.858 | 0.601 |
| 2.164557338323372 | 1.496 | 0.858 | 0.601 |
| 2.167698930976961 | 1.494 | 0.858 | 0.602 |
| 2.170840523630551 | 1.493 | 0.858 | 0.602 |
| 2.173982116284141 | 1.491 | 0.859 | 0.603 |
| 2.17712370893773 | 1.49 | 0.859 | 0.603 |
| 2.18026530159132 | 1.488 | 0.859 | 0.604 |
| 2.183406894244909 | 1.486 | 0.859 | 0.604 |
| 2.186548486898499 | 1.485 | 0.86 | 0.605 |
| 2.189690079552089 | 1.483 | 0.86 | 0.605 |
| 2.192831672205678 | 1.482 | 0.86 | 0.606 |
| 2.195973264859268 | 1.48 | 0.86 | 0.607 |
| 2.199114857512857 | 1.478 | 0.861 | 0.607 |
| 2.202256450166447 | 1.477 | 0.861 | 0.608 |
| 2.205398042820036 | 1.475 | 0.861 | 0.608 |
| 2.208539635473626 | 1.474 | 0.862 | 0.609 |
| 2.211681228127216 | 1.472 | 0.862 | 0.609 |
| 2.214822820780805 | 1.47 | 0.862 | 0.61 |
| 2.217964413434395 | 1.469 | 0.862 | 0.61 |
| 2.221106006087984 | 1.467 | 0.863 | 0.611 |
| 2.224247598741574 | 1.465 | 0.863 | 0.612 |
| 2.227389191395164 | 1.464 | 0.863 | 0.612 |
| 2.230530784048753 | 1.462 | 0.864 | 0.613 |
| 2.233672376702343 | 1.46 | 0.864 | 0.613 |
| 2.236813969355933 | 1.459 | 0.864 | 0.614 |
| 2.239955562009522 | 1.457 | 0.864 | 0.614 |
| 2.243097154663112 | 1.456 | 0.865 | 0.615 |
| 2.246238747316701 | 1.454 | 0.865 | 0.616 |
| 2.249380339970291 | 1.452 | 0.865 | 0.616 |
| 2.252521932623881 | 1.451 | 0.866 | 0.617 |
| 2.25566352527747 | 1.449 | 0.866 | 0.617 |
| 2.25880511793106 | 1.447 | 0.866 | 0.618 |
| 2.261946710584649 | 1.446 | 0.866 | 0.619 |
| 2.265088303238239 | 1.444 | 0.867 | 0.619 |
| 2.268229895891829 | 1.442 | 0.867 | 0.62 |
| 2.271371488545418 | 1.44 | 0.867 | 0.621 |
| 2.274513081199008 | 1.439 | 0.868 | 0.621 |
| 2.277654673852597 | 1.437 | 0.868 | 0.622 |
| 2.280796266506186 | 1.435 | 0.868 | 0.622 |
| 2.283937859159776 | 1.434 | 0.869 | 0.623 |
| 2.287079451813366 | 1.432 | 0.869 | 0.624 |
| 2.290221044466955 | 1.43 | 0.869 | 0.624 |
| 2.293362637120545 | 1.429 | 0.87 | 0.625 |
| 2.296504229774135 | 1.427 | 0.87 | 0.626 |
| 2.299645822427724 | 1.425 | 0.87 | 0.626 |
| 2.302787415081314 | 1.424 | 0.87 | 0.627 |
| 2.305929007734904 | 1.422 | 0.871 | 0.628 |
| 2.309070600388493 | 1.42 | 0.871 | 0.628 |
| 2.312212193042083 | 1.418 | 0.871 | 0.629 |
| 2.315353785695672 | 1.417 | 0.872 | 0.63 |
| 2.318495378349262 | 1.415 | 0.872 | 0.63 |
| 2.321636971002852 | 1.413 | 0.872 | 0.631 |
| 2.324778563656441 | 1.412 | 0.873 | 0.632 |
| 2.327920156310031 | 1.41 | 0.873 | 0.632 |
| 2.33106174896362 | 1.408 | 0.873 | 0.633 |
| 2.33420334161721 | 1.406 | 0.874 | 0.634 |
| 2.3373449342708 | 1.405 | 0.874 | 0.634 |
| 2.340486526924389 | 1.403 | 0.874 | 0.635 |
| 2.343628119577979 | 1.401 | 0.875 | 0.636 |
| 2.346769712231568 | 1.4 | 0.875 | 0.637 |
| 2.349911304885158 | 1.398 | 0.875 | 0.637 |
| 2.353052897538748 | 1.396 | 0.876 | 0.638 |
| 2.356194490192337 | 1.394 | 0.876 | 0.639 |
| 2.359336082845927 | 1.393 | 0.876 | 0.639 |
| 2.362477675499516 | 1.391 | 0.877 | 0.64 |
| 2.365619268153106 | 1.389 | 0.877 | 0.641 |
| 2.368760860806696 | 1.387 | 0.877 | 0.642 |
| 2.371902453460285 | 1.386 | 0.878 | 0.642 |
| 2.375044046113875 | 1.384 | 0.878 | 0.643 |
| 2.378185638767464 | 1.382 | 0.879 | 0.644 |
| 2.381327231421054 | 1.381 | 0.879 | 0.645 |
| 2.384468824074644 | 1.379 | 0.879 | 0.645 |
| 2.387610416728233 | 1.377 | 0.88 | 0.646 |
| 2.390752009381823 | 1.375 | 0.88 | 0.647 |
| 2.393893602035412 | 1.374 | 0.88 | 0.648 |
| 2.397035194689002 | 1.372 | 0.881 | 0.648 |
| 2.400176787342591 | 1.37 | 0.881 | 0.649 |
| 2.403318379996181 | 1.368 | 0.881 | 0.65 |
| 2.406459972649771 | 1.367 | 0.882 | 0.651 |
| 2.40960156530336 | 1.365 | 0.882 | 0.652 |
| 2.41274315795695 | 1.363 | 0.882 | 0.652 |
| 2.41588475061054 | 1.361 | 0.883 | 0.653 |
| 2.419026343264129 | 1.36 | 0.883 | 0.654 |
| 2.422167935917719 | 1.358 | 0.884 | 0.655 |
| 2.425309528571308 | 1.356 | 0.884 | 0.656 |
| 2.428451121224898 | 1.354 | 0.884 | 0.656 |
| 2.431592713878488 | 1.353 | 0.885 | 0.657 |
| 2.434734306532077 | 1.351 | 0.885 | 0.658 |
| 2.437875899185667 | 1.349 | 0.885 | 0.659 |
| 2.441017491839256 | 1.347 | 0.886 | 0.66 |
| 2.444159084492846 | 1.346 | 0.886 | 0.661 |
| 2.447300677146435 | 1.344 | 0.887 | 0.661 |
| 2.450442269800025 | 1.342 | 0.887 | 0.662 |
| 2.453583862453615 | 1.34 | 0.887 | 0.663 |
| 2.456725455107204 | 1.339 | 0.888 | 0.664 |
| 2.459867047760794 | 1.337 | 0.888 | 0.665 |
| 2.463008640414384 | 1.335 | 0.888 | 0.666 |
| 2.466150233067973 | 1.334 | 0.889 | 0.667 |
| 2.469291825721563 | 1.332 | 0.889 | 0.667 |
| 2.472433418375152 | 1.33 | 0.89 | 0.668 |
| 2.475575011028742 | 1.328 | 0.89 | 0.669 |
| 2.478716603682332 | 1.327 | 0.89 | 0.67 |
| 2.481858196335921 | 1.325 | 0.891 | 0.671 |
| 2.48499978898951 | 1.323 | 0.891 | 0.672 |
| 2.4881413816431 | 1.321 | 0.892 | 0.673 |
| 2.49128297429669 | 1.32 | 0.892 | 0.674 |
| 2.49442456695028 | 1.318 | 0.892 | 0.675 |
| 2.497566159603869 | 1.316 | 0.893 | 0.676 |
| 2.500707752257458 | 1.314 | 0.893 | 0.676 |
| 2.503849344911048 | 1.313 | 0.894 | 0.677 |
| 2.506990937564638 | 1.311 | 0.894 | 0.678 |
| 2.510132530218228 | 1.309 | 0.894 | 0.679 |
| 2.513274122871817 | 1.307 | 0.895 | 0.68 |
| 2.516415715525407 | 1.306 | 0.895 | 0.681 |
| 2.519557308178996 | 1.304 | 0.896 | 0.682 |
| 2.522698900832586 | 1.302 | 0.896 | 0.683 |
| 2.525840493486176 | 1.3 | 0.896 | 0.684 |
| 2.528982086139765 | 1.299 | 0.897 | 0.685 |
| 2.532123678793355 | 1.297 | 0.897 | 0.686 |
| 2.535265271446944 | 1.295 | 0.898 | 0.687 |
| 2.538406864100534 | 1.294 | 0.898 | 0.688 |
| 2.541548456754124 | 1.292 | 0.899 | 0.689 |
| 2.544690049407713 | 1.29 | 0.899 | 0.69 |
| 2.547831642061302 | 1.288 | 0.899 | 0.691 |
| 2.550973234714892 | 1.287 | 0.9 | 0.692 |
| 2.554114827368482 | 1.285 | 0.9 | 0.693 |
| 2.557256420022072 | 1.283 | 0.901 | 0.694 |
| 2.560398012675661 | 1.281 | 0.901 | 0.695 |
| 2.563539605329251 | 1.28 | 0.901 | 0.696 |
| 2.56668119798284 | 1.278 | 0.902 | 0.697 |
| 2.56982279063643 | 1.276 | 0.902 | 0.698 |
| 2.57296438329002 | 1.275 | 0.903 | 0.699 |
| 2.576105975943609 | 1.273 | 0.903 | 0.7 |
| 2.579247568597199 | 1.271 | 0.904 | 0.701 |
| 2.582389161250788 | 1.269 | 0.904 | 0.702 |
| 2.585530753904377 | 1.268 | 0.905 | 0.703 |
| 2.588672346557967 | 1.266 | 0.905 | 0.704 |
| 2.591813939211557 | 1.264 | 0.905 | 0.705 |
| 2.594955531865147 | 1.263 | 0.906 | 0.706 |
| 2.598097124518736 | 1.261 | 0.906 | 0.707 |
| 2.601238717172326 | 1.259 | 0.907 | 0.708 |
| 2.604380309825915 | 1.257 | 0.907 | 0.71 |
| 2.607521902479505 | 1.256 | 0.908 | 0.711 |
| 2.610663495133095 | 1.254 | 0.908 | 0.712 |
| 2.613805087786684 | 1.252 | 0.908 | 0.713 |
| 2.616946680440274 | 1.251 | 0.909 | 0.714 |
| 2.620088273093863 | 1.249 | 0.909 | 0.715 |
| 2.623229865747452 | 1.247 | 0.91 | 0.716 |
| 2.626371458401042 | 1.245 | 0.91 | 0.717 |
| 2.629513051054632 | 1.244 | 0.911 | 0.718 |
| 2.632654643708222 | 1.242 | 0.911 | 0.72 |
| 2.635796236361811 | 1.24 | 0.912 | 0.721 |
| 2.638937829015401 | 1.239 | 0.912 | 0.722 |
| 2.642079421668991 | 1.237 | 0.913 | 0.723 |
| 2.64522101432258 | 1.235 | 0.913 | 0.724 |
| 2.64836260697617 | 1.234 | 0.913 | 0.725 |
| 2.651504199629759 | 1.232 | 0.914 | 0.726 |
| 2.654645792283349 | 1.23 | 0.914 | 0.728 |
| 2.657787384936938 | 1.229 | 0.915 | 0.729 |
| 2.660928977590528 | 1.227 | 0.915 | 0.73 |
| 2.664070570244118 | 1.225 | 0.916 | 0.731 |
| 2.667212162897707 | 1.224 | 0.916 | 0.732 |
| 2.670353755551297 | 1.222 | 0.917 | 0.734 |
| 2.673495348204887 | 1.22 | 0.917 | 0.735 |
| 2.676636940858476 | 1.219 | 0.918 | 0.736 |
| 2.679778533512066 | 1.217 | 0.918 | 0.737 |
| 2.682920126165655 | 1.215 | 0.919 | 0.738 |
| 2.686061718819245 | 1.214 | 0.919 | 0.74 |
| 2.689203311472835 | 1.212 | 0.92 | 0.741 |
| 2.692344904126424 | 1.21 | 0.92 | 0.742 |
| 2.695486496780014 | 1.209 | 0.921 | 0.743 |
| 2.698628089433603 | 1.207 | 0.921 | 0.745 |
| 2.701769682087193 | 1.205 | 0.922 | 0.746 |
| 2.704911274740782 | 1.204 | 0.922 | 0.747 |
| 2.708052867394372 | 1.202 | 0.922 | 0.748 |
| 2.711194460047962 | 1.2 | 0.923 | 0.75 |
| 2.714336052701551 | 1.199 | 0.923 | 0.751 |
| 2.717477645355141 | 1.197 | 0.924 | 0.752 |
| 2.720619238008731 | 1.195 | 0.924 | 0.754 |
| 2.72376083066232 | 1.194 | 0.925 | 0.755 |
| 2.72690242331591 | 1.192 | 0.925 | 0.756 |
| 2.730044015969499 | 1.19 | 0.926 | 0.758 |
| 2.733185608623089 | 1.189 | 0.926 | 0.759 |
| 2.736327201276678 | 1.187 | 0.927 | 0.76 |
| 2.739468793930268 | 1.186 | 0.927 | 0.762 |
| 2.742610386583858 | 1.184 | 0.928 | 0.763 |
| 2.745751979237447 | 1.182 | 0.928 | 0.764 |
| 2.748893571891036 | 1.181 | 0.929 | 0.766 |
| 2.752035164544627 | 1.179 | 0.929 | 0.767 |
| 2.755176757198216 | 1.178 | 0.93 | 0.768 |
| 2.758318349851806 | 1.176 | 0.93 | 0.77 |
| 2.761459942505395 | 1.174 | 0.931 | 0.771 |
| 2.764601535158985 | 1.173 | 0.931 | 0.772 |
| 2.767743127812574 | 1.171 | 0.932 | 0.774 |
| 2.770884720466164 | 1.169 | 0.932 | 0.775 |
| 2.774026313119754 | 1.168 | 0.933 | 0.777 |
| 2.777167905773343 | 1.166 | 0.933 | 0.778 |
| 2.780309498426932 | 1.165 | 0.934 | 0.78 |
| 2.783451091080522 | 1.163 | 0.934 | 0.781 |
| 2.786592683734112 | 1.161 | 0.935 | 0.782 |
| 2.789734276387701 | 1.16 | 0.936 | 0.784 |
| 2.792875869041291 | 1.158 | 0.936 | 0.785 |
| 2.796017461694881 | 1.157 | 0.937 | 0.787 |
| 2.79915905434847 | 1.155 | 0.937 | 0.788 |
| 2.80230064700206 | 1.154 | 0.938 | 0.79 |
| 2.80544223965565 | 1.152 | 0.938 | 0.791 |
| 2.808583832309239 | 1.15 | 0.939 | 0.793 |
| 2.811725424962829 | 1.149 | 0.939 | 0.794 |
| 2.814867017616419 | 1.147 | 0.94 | 0.796 |
| 2.818008610270008 | 1.146 | 0.94 | 0.797 |
| 2.821150202923598 | 1.144 | 0.941 | 0.799 |
| 2.824291795577187 | 1.143 | 0.941 | 0.8 |
| 2.827433388230777 | 1.141 | 0.942 | 0.802 |
| 2.830574980884366 | 1.139 | 0.942 | 0.803 |
| 2.833716573537956 | 1.138 | 0.943 | 0.805 |
| 2.836858166191546 | 1.136 | 0.943 | 0.806 |
| 2.839999758845135 | 1.135 | 0.944 | 0.808 |
| 2.843141351498725 | 1.133 | 0.944 | 0.81 |
| 2.846282944152314 | 1.132 | 0.945 | 0.811 |
| 2.849424536805904 | 1.13 | 0.946 | 0.813 |
| 2.852566129459494 | 1.129 | 0.946 | 0.814 |
| 2.855707722113083 | 1.127 | 0.947 | 0.816 |
| 2.858849314766673 | 1.126 | 0.947 | 0.818 |
| 2.861990907420262 | 1.124 | 0.948 | 0.819 |
| 2.865132500073852 | 1.123 | 0.948 | 0.821 |
| 2.868274092727442 | 1.121 | 0.949 | 0.822 |
| 2.871415685381031 | 1.12 | 0.949 | 0.824 |
| 2.874557278034621 | 1.118 | 0.95 | 0.826 |
| 2.87769887068821 | 1.116 | 0.95 | 0.827 |
| 2.8808404633418 | 1.115 | 0.951 | 0.829 |
| 2.88398205599539 | 1.113 | 0.952 | 0.831 |
| 2.88712364864898 | 1.112 | 0.952 | 0.832 |
| 2.890265241302569 | 1.11 | 0.953 | 0.834 |
| 2.893406833956158 | 1.109 | 0.953 | 0.836 |
| 2.896548426609748 | 1.107 | 0.954 | 0.837 |
| 2.899690019263338 | 1.106 | 0.954 | 0.839 |
| 2.902831611916927 | 1.104 | 0.955 | 0.841 |
| 2.905973204570517 | 1.103 | 0.955 | 0.843 |
| 2.909114797224106 | 1.102 | 0.956 | 0.844 |
| 2.912256389877696 | 1.1 | 0.957 | 0.846 |
| 2.915397982531286 | 1.099 | 0.957 | 0.848 |
| 2.918539575184875 | 1.097 | 0.958 | 0.85 |
| 2.921681167838465 | 1.096 | 0.958 | 0.851 |
| 2.924822760492054 | 1.094 | 0.959 | 0.853 |
| 2.927964353145644 | 1.093 | 0.959 | 0.855 |
| 2.931105945799234 | 1.091 | 0.96 | 0.857 |
| 2.934247538452823 | 1.09 | 0.96 | 0.859 |
| 2.937389131106413 | 1.088 | 0.961 | 0.86 |
| 2.940530723760002 | 1.087 | 0.962 | 0.862 |
| 2.943672316413592 | 1.085 | 0.962 | 0.864 |
| 2.946813909067182 | 1.084 | 0.963 | 0.866 |
| 2.949955501720771 | 1.082 | 0.963 | 0.868 |
| 2.953097094374361 | 1.081 | 0.964 | 0.87 |
| 2.95623868702795 | 1.08 | 0.964 | 0.872 |
| 2.95938027968154 | 1.078 | 0.965 | 0.873 |
| 2.96252187233513 | 1.077 | 0.966 | 0.875 |
| 2.965663464988719 | 1.075 | 0.966 | 0.877 |
| 2.968805057642309 | 1.074 | 0.967 | 0.879 |
| 2.971946650295898 | 1.072 | 0.967 | 0.881 |
| 2.975088242949488 | 1.071 | 0.968 | 0.883 |
| 2.978229835603078 | 1.07 | 0.968 | 0.885 |
| 2.981371428256667 | 1.068 | 0.969 | 0.887 |
| 2.984513020910257 | 1.067 | 0.97 | 0.889 |
| 2.987654613563846 | 1.065 | 0.97 | 0.891 |
| 2.990796206217436 | 1.064 | 0.971 | 0.893 |
| 2.993937798871025 | 1.063 | 0.971 | 0.895 |
| 2.997079391524615 | 1.061 | 0.972 | 0.897 |
| 3.000220984178205 | 1.06 | 0.973 | 0.899 |
| 3.003362576831794 | 1.058 | 0.973 | 0.901 |
| 3.006504169485384 | 1.057 | 0.974 | 0.903 |
| 3.009645762138974 | 1.056 | 0.974 | 0.905 |
| 3.012787354792563 | 1.054 | 0.975 | 0.907 |
| 3.015928947446153 | 1.053 | 0.976 | 0.909 |
| 3.019070540099742 | 1.051 | 0.976 | 0.911 |
| 3.022212132753332 | 1.05 | 0.977 | 0.913 |
| 3.025353725406922 | 1.049 | 0.977 | 0.915 |
| 3.028495318060511 | 1.047 | 0.978 | 0.917 |
| 3.031636910714101 | 1.046 | 0.979 | 0.919 |
| 3.03477850336769 | 1.045 | 0.979 | 0.921 |
| 3.03792009602128 | 1.043 | 0.98 | 0.924 |
| 3.04106168867487 | 1.042 | 0.98 | 0.926 |
| 3.04420328132846 | 1.04 | 0.981 | 0.928 |
| 3.047344873982049 | 1.039 | 0.982 | 0.93 |
| 3.050486466635638 | 1.038 | 0.982 | 0.932 |
| 3.053628059289228 | 1.036 | 0.983 | 0.934 |
| 3.056769651942818 | 1.035 | 0.983 | 0.937 |
| 3.059911244596407 | 1.034 | 0.984 | 0.939 |
| 3.063052837249997 | 1.032 | 0.985 | 0.941 |
| 3.066194429903586 | 1.031 | 0.985 | 0.943 |
| 3.069336022557176 | 1.03 | 0.986 | 0.945 |
| 3.072477615210766 | 1.028 | 0.986 | 0.948 |
| 3.075619207864355 | 1.027 | 0.987 | 0.95 |
| 3.078760800517945 | 1.026 | 0.988 | 0.952 |
| 3.081902393171534 | 1.024 | 0.988 | 0.954 |
| 3.085043985825124 | 1.023 | 0.989 | 0.957 |
| 3.088185578478713 | 1.022 | 0.989 | 0.959 |
| 3.091327171132303 | 1.021 | 0.99 | 0.961 |
| 3.094468763785893 | 1.019 | 0.991 | 0.964 |
| 3.097610356439482 | 1.018 | 0.991 | 0.966 |
| 3.100751949093072 | 1.017 | 0.992 | 0.968 |
| 3.103893541746661 | 1.015 | 0.993 | 0.971 |
| 3.107035134400251 | 1.014 | 0.993 | 0.973 |
| 3.110176727053841 | 1.013 | 0.994 | 0.975 |
| 3.11331831970743 | 1.011 | 0.994 | 0.978 |
| 3.11645991236102 | 1.01 | 0.995 | 0.98 |
| 3.11960150501461 | 1.009 | 0.996 | 0.983 |
| 3.122743097668199 | 1.008 | 0.996 | 0.985 |
| 3.125884690321789 | 1.006 | 0.997 | 0.988 |
| 3.129026282975378 | 1.005 | 0.997 | 0.99 |
| 3.132167875628968 | 1.004 | 0.998 | 0.993 |
| 3.135309468282557 | 1.003 | 0.999 | 0.995 |
| 3.138451060936147 | 1.001 | 0.999 | 0.997 |
| 3.141592653589737 | 1 | 1 | 1 |
| 3.144734246243326 | 0.999 | 1.001 | 1.003 |
| 3.147875838896916 | 0.997 | 1.001 | 1.005 |
| 3.151017431550505 | 0.996 | 1.002 | 1.008 |
| 3.154159024204095 | 0.995 | 1.003 | 1.01 |
| 3.157300616857685 | 0.994 | 1.003 | 1.013 |
| 3.160442209511274 | 0.993 | 1.004 | 1.015 |
| 3.163583802164864 | 0.991 | 1.004 | 1.018 |
| 3.166725394818453 | 0.99 | 1.005 | 1.021 |
| 3.169866987472043 | 0.989 | 1.006 | 1.023 |
| 3.173008580125633 | 0.988 | 1.006 | 1.026 |
| 3.176150172779222 | 0.986 | 1.007 | 1.028 |
| 3.179291765432812 | 0.985 | 1.008 | 1.031 |
| 3.182433358086401 | 0.984 | 1.008 | 1.034 |
| 3.185574950739991 | 0.983 | 1.009 | 1.036 |
| 3.188716543393581 | 0.982 | 1.01 | 1.039 |
| 3.19185813604717 | 0.98 | 1.01 | 1.042 |
| 3.19499972870076 | 0.979 | 1.011 | 1.045 |
| 3.198141321354349 | 0.978 | 1.011 | 1.047 |
| 3.20128291400794 | 0.977 | 1.012 | 1.05 |
| 3.204424506661528 | 0.975 | 1.013 | 1.053 |
| 3.207566099315118 | 0.974 | 1.013 | 1.056 |
| 3.210707691968708 | 0.973 | 1.014 | 1.058 |
| 3.213849284622297 | 0.972 | 1.015 | 1.061 |
| 3.216990877275887 | 0.971 | 1.015 | 1.064 |
| 3.220132469929476 | 0.97 | 1.016 | 1.067 |
| 3.223274062583066 | 0.968 | 1.017 | 1.07 |
| 3.226415655236656 | 0.967 | 1.017 | 1.073 |
| 3.229557247890245 | 0.966 | 1.018 | 1.076 |
| 3.232698840543835 | 0.965 | 1.019 | 1.078 |
| 3.235840433197425 | 0.964 | 1.019 | 1.081 |
| 3.238982025851014 | 0.963 | 1.02 | 1.084 |
| 3.242123618504604 | 0.961 | 1.02 | 1.087 |
| 3.245265211158193 | 0.96 | 1.021 | 1.09 |
| 3.248406803811783 | 0.959 | 1.022 | 1.093 |
| 3.251548396465373 | 0.958 | 1.022 | 1.096 |
| 3.254689989118962 | 0.957 | 1.023 | 1.099 |
| 3.257831581772551 | 0.956 | 1.024 | 1.102 |
| 3.260973174426141 | 0.955 | 1.024 | 1.105 |
| 3.26411476707973 | 0.953 | 1.025 | 1.108 |
| 3.267256359733321 | 0.952 | 1.026 | 1.111 |
| 3.27039795238691 | 0.951 | 1.026 | 1.115 |
| 3.2735395450405 | 0.95 | 1.027 | 1.118 |
| 3.276681137694089 | 0.949 | 1.028 | 1.121 |
| 3.279822730347679 | 0.948 | 1.028 | 1.124 |
| 3.282964323001269 | 0.947 | 1.029 | 1.127 |
| 3.286105915654858 | 0.946 | 1.03 | 1.13 |
| 3.289247508308448 | 0.944 | 1.03 | 1.133 |
| 3.292389100962037 | 0.943 | 1.031 | 1.137 |
| 3.295530693615627 | 0.942 | 1.032 | 1.14 |
| 3.298672286269217 | 0.941 | 1.032 | 1.143 |
| 3.301813878922806 | 0.94 | 1.033 | 1.146 |
| 3.304955471576396 | 0.939 | 1.034 | 1.15 |
| 3.308097064229985 | 0.938 | 1.034 | 1.153 |
| 3.311238656883575 | 0.937 | 1.035 | 1.156 |
| 3.314380249537165 | 0.936 | 1.036 | 1.159 |
| 3.317521842190754 | 0.935 | 1.036 | 1.163 |
| 3.320663434844344 | 0.933 | 1.037 | 1.166 |
| 3.323805027497933 | 0.932 | 1.038 | 1.17 |
| 3.326946620151523 | 0.931 | 1.038 | 1.173 |
| 3.330088212805113 | 0.93 | 1.039 | 1.176 |
| 3.333229805458702 | 0.929 | 1.04 | 1.18 |
| 3.336371398112292 | 0.928 | 1.04 | 1.183 |
| 3.339512990765881 | 0.927 | 1.041 | 1.187 |
| 3.342654583419471 | 0.926 | 1.042 | 1.19 |
| 3.345796176073061 | 0.925 | 1.042 | 1.194 |
| 3.34893776872665 | 0.924 | 1.043 | 1.197 |
| 3.35207936138024 | 0.923 | 1.044 | 1.201 |
| 3.355220954033829 | 0.922 | 1.044 | 1.204 |
| 3.358362546687419 | 0.921 | 1.045 | 1.208 |
| 3.361504139341009 | 0.92 | 1.046 | 1.211 |
| 3.364645731994598 | 0.919 | 1.046 | 1.215 |
| 3.367787324648188 | 0.918 | 1.047 | 1.219 |
| 3.370928917301777 | 0.917 | 1.048 | 1.222 |
| 3.374070509955367 | 0.916 | 1.048 | 1.226 |
| 3.377212102608956 | 0.915 | 1.049 | 1.23 |
| 3.380353695262546 | 0.914 | 1.05 | 1.233 |
| 3.383495287916136 | 0.913 | 1.05 | 1.237 |
| 3.386636880569725 | 0.912 | 1.051 | 1.241 |
| 3.389778473223315 | 0.911 | 1.052 | 1.245 |
| 3.392920065876904 | 0.91 | 1.052 | 1.248 |
| 3.396061658530494 | 0.909 | 1.053 | 1.252 |
| 3.399203251184084 | 0.908 | 1.054 | 1.256 |
| 3.402344843837673 | 0.907 | 1.054 | 1.26 |
| 3.405486436491263 | 0.906 | 1.055 | 1.264 |
| 3.408628029144852 | 0.905 | 1.056 | 1.268 |
| 3.411769621798442 | 0.904 | 1.056 | 1.271 |
| 3.414911214452032 | 0.903 | 1.057 | 1.275 |
| 3.418052807105621 | 0.902 | 1.058 | 1.279 |
| 3.421194399759211 | 0.901 | 1.058 | 1.283 |
| 3.4243359924128 | 0.9 | 1.059 | 1.287 |
| 3.42747758506639 | 0.899 | 1.06 | 1.291 |
| 3.43061917771998 | 0.898 | 1.06 | 1.295 |
| 3.433760770373569 | 0.897 | 1.061 | 1.299 |
| 3.436902363027159 | 0.896 | 1.062 | 1.303 |
| 3.440043955680748 | 0.895 | 1.062 | 1.308 |
| 3.443185548334338 | 0.894 | 1.063 | 1.312 |
| 3.446327140987927 | 0.893 | 1.064 | 1.316 |
| 3.449468733641517 | 0.892 | 1.065 | 1.32 |
| 3.452610326295107 | 0.891 | 1.065 | 1.324 |
| 3.455751918948696 | 0.89 | 1.066 | 1.328 |
| 3.458893511602286 | 0.889 | 1.067 | 1.333 |
| 3.462035104255876 | 0.888 | 1.067 | 1.337 |
| 3.465176696909465 | 0.887 | 1.068 | 1.341 |
| 3.468318289563055 | 0.886 | 1.069 | 1.345 |
| 3.471459882216644 | 0.885 | 1.069 | 1.35 |
| 3.474601474870234 | 0.884 | 1.07 | 1.354 |
| 3.477743067523824 | 0.883 | 1.071 | 1.358 |
| 3.480884660177413 | 0.883 | 1.071 | 1.363 |
| 3.484026252831002 | 0.882 | 1.072 | 1.367 |
| 3.487167845484592 | 0.881 | 1.073 | 1.372 |
| 3.490309438138182 | 0.88 | 1.073 | 1.376 |
| 3.493451030791772 | 0.879 | 1.074 | 1.381 |
| 3.496592623445361 | 0.878 | 1.075 | 1.385 |
| 3.499734216098951 | 0.877 | 1.075 | 1.39 |
| 3.50287580875254 | 0.876 | 1.076 | 1.394 |
| 3.50601740140613 | 0.875 | 1.077 | 1.399 |
| 3.50915899405972 | 0.874 | 1.077 | 1.403 |
| 3.512300586713309 | 0.873 | 1.078 | 1.408 |
| 3.515442179366899 | 0.873 | 1.079 | 1.413 |
| 3.518583772020488 | 0.872 | 1.079 | 1.417 |
| 3.521725364674078 | 0.871 | 1.08 | 1.422 |
| 3.524866957327668 | 0.87 | 1.081 | 1.427 |
| 3.528008549981257 | 0.869 | 1.082 | 1.432 |
| 3.531150142634847 | 0.868 | 1.082 | 1.436 |
| 3.534291735288436 | 0.867 | 1.083 | 1.441 |
| 3.537433327942026 | 0.866 | 1.084 | 1.446 |
| 3.540574920595616 | 0.866 | 1.084 | 1.451 |
| 3.543716513249205 | 0.865 | 1.085 | 1.456 |
| 3.546858105902795 | 0.864 | 1.086 | 1.461 |
| 3.549999698556384 | 0.863 | 1.086 | 1.466 |
| 3.553141291209974 | 0.862 | 1.087 | 1.471 |
| 3.556282883863564 | 0.861 | 1.088 | 1.476 |
| 3.559424476517153 | 0.86 | 1.088 | 1.481 |
| 3.562566069170743 | 0.86 | 1.089 | 1.486 |
| 3.565707661824332 | 0.859 | 1.09 | 1.491 |
| 3.568849254477922 | 0.858 | 1.09 | 1.496 |
| 3.571990847131511 | 0.857 | 1.091 | 1.501 |
| 3.575132439785101 | 0.856 | 1.092 | 1.506 |
| 3.578274032438691 | 0.855 | 1.092 | 1.511 |
| 3.58141562509228 | 0.854 | 1.093 | 1.517 |
| 3.58455721774587 | 0.854 | 1.094 | 1.522 |
| 3.58769881039946 | 0.853 | 1.094 | 1.527 |
| 3.590840403053049 | 0.852 | 1.095 | 1.532 |
| 3.593981995706639 | 0.851 | 1.096 | 1.538 |
| 3.597123588360228 | 0.85 | 1.096 | 1.543 |
| 3.600265181013818 | 0.85 | 1.097 | 1.548 |
| 3.603406773667407 | 0.849 | 1.098 | 1.554 |
| 3.606548366320997 | 0.848 | 1.099 | 1.559 |
| 3.609689958974587 | 0.847 | 1.099 | 1.565 |
| 3.612831551628176 | 0.846 | 1.1 | 1.57 |
| 3.615973144281766 | 0.846 | 1.101 | 1.576 |
| 3.619114736935355 | 0.845 | 1.101 | 1.581 |
| 3.622256329588945 | 0.844 | 1.102 | 1.587 |
| 3.625397922242534 | 0.843 | 1.103 | 1.593 |
| 3.628539514896124 | 0.842 | 1.103 | 1.598 |
| 3.631681107549714 | 0.842 | 1.104 | 1.604 |
| 3.634822700203303 | 0.841 | 1.105 | 1.61 |
| 3.637964292856893 | 0.84 | 1.105 | 1.615 |
| 3.641105885510483 | 0.839 | 1.106 | 1.621 |
| 3.644247478164072 | 0.838 | 1.107 | 1.627 |
| 3.647389070817662 | 0.838 | 1.107 | 1.633 |
| 3.650530663471251 | 0.837 | 1.108 | 1.639 |
| 3.653672256124841 | 0.836 | 1.109 | 1.645 |
| 3.656813848778431 | 0.835 | 1.109 | 1.651 |
| 3.65995544143202 | 0.835 | 1.11 | 1.657 |
| 3.66309703408561 | 0.834 | 1.111 | 1.663 |
| 3.666238626739199 | 0.833 | 1.111 | 1.669 |
| 3.66938021939279 | 0.832 | 1.112 | 1.675 |
| 3.672521812046378 | 0.832 | 1.113 | 1.681 |
| 3.675663404699968 | 0.831 | 1.113 | 1.687 |
| 3.678804997353558 | 0.83 | 1.114 | 1.693 |
| 3.681946590007147 | 0.829 | 1.115 | 1.699 |
| 3.685088182660737 | 0.829 | 1.115 | 1.706 |
| 3.688229775314326 | 0.828 | 1.116 | 1.712 |
| 3.691371367967916 | 0.827 | 1.117 | 1.718 |
| 3.694512960621506 | 0.826 | 1.117 | 1.725 |
| 3.697654553275095 | 0.826 | 1.118 | 1.731 |
| 3.700796145928685 | 0.825 | 1.119 | 1.737 |
| 3.703937738582274 | 0.824 | 1.119 | 1.744 |
| 3.707079331235864 | 0.823 | 1.12 | 1.75 |
| 3.710220923889454 | 0.823 | 1.121 | 1.757 |
| 3.713362516543043 | 0.822 | 1.121 | 1.763 |
| 3.716504109196633 | 0.821 | 1.122 | 1.77 |
| 3.719645701850223 | 0.821 | 1.123 | 1.777 |
| 3.722787294503812 | 0.82 | 1.123 | 1.783 |
| 3.725928887157402 | 0.819 | 1.124 | 1.79 |
| 3.729070479810991 | 0.819 | 1.125 | 1.797 |
| 3.732212072464581 | 0.818 | 1.125 | 1.803 |
| 3.735353665118171 | 0.817 | 1.126 | 1.81 |
| 3.73849525777176 | 0.816 | 1.127 | 1.817 |
| 3.74163685042535 | 0.816 | 1.127 | 1.824 |
| 3.744778443078939 | 0.815 | 1.128 | 1.831 |
| 3.747920035732529 | 0.814 | 1.129 | 1.838 |
| 3.751061628386119 | 0.814 | 1.129 | 1.845 |
| 3.754203221039708 | 0.813 | 1.13 | 1.852 |
| 3.757344813693298 | 0.812 | 1.131 | 1.859 |
| 3.760486406346887 | 0.812 | 1.131 | 1.866 |
| 3.763627999000477 | 0.811 | 1.132 | 1.873 |
| 3.766769591654067 | 0.81 | 1.133 | 1.88 |
| 3.769911184307656 | 0.81 | 1.133 | 1.888 |
| 3.773052776961246 | 0.809 | 1.134 | 1.895 |
| 3.776194369614835 | 0.808 | 1.135 | 1.902 |
| 3.779335962268425 | 0.808 | 1.135 | 1.91 |
| 3.782477554922014 | 0.807 | 1.136 | 1.917 |
| 3.785619147575604 | 0.806 | 1.136 | 1.924 |
| 3.788760740229193 | 0.806 | 1.137 | 1.932 |
| 3.791902332882783 | 0.805 | 1.138 | 1.939 |
| 3.795043925536373 | 0.804 | 1.138 | 1.947 |
| 3.798185518189962 | 0.804 | 1.139 | 1.954 |
| 3.801327110843552 | 0.803 | 1.14 | 1.962 |
| 3.804468703497142 | 0.802 | 1.14 | 1.97 |
| 3.807610296150731 | 0.802 | 1.141 | 1.977 |
| 3.810751888804321 | 0.801 | 1.142 | 1.985 |
| 3.813893481457911 | 0.801 | 1.142 | 1.993 |
| 3.8170350741115 | 0.8 | 1.143 | 2.001 |
| 3.82017666676509 | 0.799 | 1.144 | 2.009 |
| 3.823318259418679 | 0.799 | 1.144 | 2.017 |
| 3.826459852072269 | 0.798 | 1.145 | 2.025 |
| 3.829601444725859 | 0.797 | 1.145 | 2.033 |
| 3.832743037379448 | 0.797 | 1.146 | 2.041 |
| 3.835884630033038 | 0.796 | 1.147 | 2.049 |
| 3.839026222686627 | 0.796 | 1.147 | 2.057 |
| 3.842167815340217 | 0.795 | 1.148 | 2.065 |
| 3.845309407993807 | 0.794 | 1.149 | 2.073 |
| 3.848451000647396 | 0.794 | 1.149 | 2.081 |
| 3.851592593300986 | 0.793 | 1.15 | 2.09 |
| 3.854734185954575 | 0.793 | 1.151 | 2.098 |
| 3.857875778608165 | 0.792 | 1.151 | 2.106 |
| 3.861017371261755 | 0.791 | 1.152 | 2.115 |
| 3.864158963915344 | 0.791 | 1.152 | 2.123 |
| 3.867300556568933 | 0.79 | 1.153 | 2.132 |
| 3.870442149222523 | 0.79 | 1.154 | 2.14 |
| 3.873583741876112 | 0.789 | 1.154 | 2.149 |
| 3.876725334529703 | 0.788 | 1.155 | 2.158 |
| 3.879866927183292 | 0.788 | 1.156 | 2.166 |
| 3.883008519836882 | 0.787 | 1.156 | 2.175 |
| 3.886150112490471 | 0.787 | 1.157 | 2.184 |
| 3.889291705144061 | 0.786 | 1.157 | 2.193 |
| 3.892433297797651 | 0.786 | 1.158 | 2.202 |
| 3.89557489045124 | 0.785 | 1.159 | 2.211 |
| 3.89871648310483 | 0.784 | 1.159 | 2.22 |
| 3.901858075758419 | 0.784 | 1.16 | 2.229 |
| 3.904999668412009 | 0.783 | 1.16 | 2.238 |
| 3.908141261065598 | 0.783 | 1.161 | 2.247 |
| 3.911282853719188 | 0.782 | 1.162 | 2.256 |
| 3.914424446372778 | 0.782 | 1.162 | 2.265 |
| 3.917566039026367 | 0.781 | 1.163 | 2.274 |
| 3.920707631679957 | 0.781 | 1.164 | 2.284 |
| 3.923849224333547 | 0.78 | 1.164 | 2.293 |
| 3.926990816987136 | 0.78 | 1.165 | 2.302 |
| 3.930132409640726 | 0.779 | 1.165 | 2.312 |
| 3.933274002294315 | 0.778 | 1.166 | 2.321 |
| 3.936415594947905 | 0.778 | 1.167 | 2.331 |
| 3.939557187601495 | 0.777 | 1.167 | 2.341 |
| 3.942698780255084 | 0.777 | 1.168 | 2.35 |
| 3.945840372908674 | 0.776 | 1.168 | 2.36 |
| 3.948981965562263 | 0.776 | 1.169 | 2.37 |
| 3.952123558215853 | 0.775 | 1.169 | 2.379 |
| 3.955265150869442 | 0.775 | 1.17 | 2.389 |
| 3.958406743523032 | 0.774 | 1.171 | 2.399 |
| 3.961548336176622 | 0.774 | 1.171 | 2.409 |
| 3.964689928830211 | 0.773 | 1.172 | 2.419 |
| 3.967831521483801 | 0.773 | 1.172 | 2.429 |
| 3.97097311413739 | 0.772 | 1.173 | 2.439 |
| 3.97411470679098 | 0.772 | 1.174 | 2.449 |
| 3.97725629944457 | 0.771 | 1.174 | 2.459 |
| 3.98039789209816 | 0.771 | 1.175 | 2.47 |
| 3.983539484751749 | 0.77 | 1.175 | 2.48 |
| 3.986681077405338 | 0.77 | 1.176 | 2.49 |
| 3.989822670058928 | 0.769 | 1.177 | 2.501 |
| 3.992964262712517 | 0.769 | 1.177 | 2.511 |
| 3.996105855366107 | 0.768 | 1.178 | 2.521 |
| 3.999247448019697 | 0.768 | 1.178 | 2.532 |
| 4.002389040673287 | 0.767 | 1.179 | 2.543 |
| 4.005530633326877 | 0.767 | 1.179 | 2.553 |
| 4.008672225980466 | 0.766 | 1.18 | 2.564 |
| 4.011813818634056 | 0.766 | 1.18 | 2.575 |
| 4.014955411287645 | 0.765 | 1.181 | 2.585 |
| 4.018097003941234 | 0.765 | 1.182 | 2.596 |
| 4.021238596594824 | 0.764 | 1.182 | 2.607 |
| 4.024380189248414 | 0.764 | 1.183 | 2.618 |
| 4.027521781902004 | 0.763 | 1.183 | 2.629 |
| 4.030663374555593 | 0.763 | 1.184 | 2.64 |
| 4.033804967209183 | 0.763 | 1.184 | 2.651 |
| 4.036946559862773 | 0.762 | 1.185 | 2.662 |
| 4.040088152516362 | 0.762 | 1.186 | 2.673 |
| 4.043229745169951 | 0.761 | 1.186 | 2.684 |
| 4.046371337823541 | 0.761 | 1.187 | 2.696 |
| 4.049512930477131 | 0.76 | 1.187 | 2.707 |
| 4.05265452313072 | 0.76 | 1.188 | 2.718 |
| 4.05579611578431 | 0.759 | 1.188 | 2.73 |
| 4.0589377084379 | 0.759 | 1.189 | 2.741 |
| 4.062079301091489 | 0.759 | 1.189 | 2.753 |
| 4.065220893745079 | 0.758 | 1.19 | 2.764 |
| 4.068362486398668 | 0.758 | 1.19 | 2.776 |
| 4.071504079052258 | 0.757 | 1.191 | 2.787 |
| 4.074645671705848 | 0.757 | 1.191 | 2.799 |
| 4.077787264359437 | 0.756 | 1.192 | 2.811 |
| 4.080928857013027 | 0.756 | 1.193 | 2.823 |
| 4.084070449666616 | 0.756 | 1.193 | 2.835 |
| 4.087212042320206 | 0.755 | 1.194 | 2.846 |
| 4.090353634973795 | 0.755 | 1.194 | 2.858 |
| 4.093495227627385 | 0.754 | 1.195 | 2.87 |
| 4.096636820280975 | 0.754 | 1.195 | 2.882 |
| 4.099778412934564 | 0.753 | 1.196 | 2.895 |
| 4.102920005588154 | 0.753 | 1.196 | 2.907 |
| 4.106061598241744 | 0.753 | 1.197 | 2.919 |
| 4.109203190895333 | 0.752 | 1.197 | 2.931 |
| 4.112344783548923 | 0.752 | 1.198 | 2.943 |
| 4.115486376202512 | 0.751 | 1.198 | 2.956 |
| 4.118627968856102 | 0.751 | 1.199 | 2.968 |
| 4.121769561509692 | 0.751 | 1.199 | 2.98 |
| 4.124911154163281 | 0.75 | 1.2 | 2.993 |
| 4.128052746816871 | 0.75 | 1.2 | 3.005 |
| 4.13119433947046 | 0.749 | 1.201 | 3.018 |
| 4.13433593212405 | 0.749 | 1.201 | 3.031 |
| 4.13747752477764 | 0.749 | 1.202 | 3.043 |
| 4.14061911743123 | 0.748 | 1.202 | 3.056 |
| 4.143760710084818 | 0.748 | 1.203 | 3.069 |
| 4.146902302738408 | 0.748 | 1.203 | 3.081 |
| 4.150043895391998 | 0.747 | 1.204 | 3.094 |
| 4.153185488045588 | 0.747 | 1.204 | 3.107 |
| 4.156327080699177 | 0.746 | 1.205 | 3.12 |
| 4.159468673352766 | 0.746 | 1.205 | 3.133 |
| 4.162610266006356 | 0.746 | 1.206 | 3.146 |
| 4.165751858659946 | 0.745 | 1.206 | 3.159 |
| 4.168893451313535 | 0.745 | 1.207 | 3.172 |
| 4.172035043967125 | 0.745 | 1.207 | 3.185 |
| 4.175176636620715 | 0.744 | 1.207 | 3.198 |
| 4.178318229274304 | 0.744 | 1.208 | 3.211 |
| 4.181459821927894 | 0.744 | 1.208 | 3.224 |
| 4.184601414581484 | 0.743 | 1.209 | 3.238 |
| 4.187743007235073 | 0.743 | 1.209 | 3.251 |
| 4.190884599888663 | 0.742 | 1.21 | 3.264 |
| 4.194026192542252 | 0.742 | 1.21 | 3.278 |
| 4.197167785195842 | 0.742 | 1.211 | 3.291 |
| 4.200309377849432 | 0.741 | 1.211 | 3.304 |
| 4.203450970503021 | 0.741 | 1.212 | 3.318 |
| 4.206592563156611 | 0.741 | 1.212 | 3.331 |
| 4.2097341558102 | 0.74 | 1.213 | 3.345 |
| 4.21287574846379 | 0.74 | 1.213 | 3.359 |
| 4.21601734111738 | 0.74 | 1.213 | 3.372 |
| 4.21915893377097 | 0.739 | 1.214 | 3.386 |
| 4.222300526424559 | 0.739 | 1.214 | 3.399 |
| 4.225442119078148 | 0.739 | 1.215 | 3.413 |
| 4.228583711731738 | 0.739 | 1.215 | 3.427 |
| 4.231725304385327 | 0.738 | 1.216 | 3.441 |
| 4.234866897038917 | 0.738 | 1.216 | 3.454 |
| 4.238008489692506 | 0.738 | 1.216 | 3.468 |
| 4.241150082346096 | 0.737 | 1.217 | 3.482 |
| 4.244291674999685 | 0.737 | 1.217 | 3.496 |
| 4.247433267653276 | 0.737 | 1.218 | 3.51 |
| 4.250574860306865 | 0.736 | 1.218 | 3.524 |
| 4.253716452960455 | 0.736 | 1.219 | 3.537 |
| 4.256858045614044 | 0.736 | 1.219 | 3.551 |
| 4.259999638267634 | 0.735 | 1.219 | 3.565 |
| 4.263141230921224 | 0.735 | 1.22 | 3.579 |
| 4.266282823574813 | 0.735 | 1.22 | 3.593 |
| 4.269424416228403 | 0.735 | 1.221 | 3.607 |
| 4.272566008881992 | 0.734 | 1.221 | 3.621 |
| 4.275707601535582 | 0.734 | 1.221 | 3.635 |
| 4.27884919418917 | 0.734 | 1.222 | 3.649 |
| 4.28199078684276 | 0.733 | 1.222 | 3.664 |
| 4.285132379496351 | 0.733 | 1.223 | 3.678 |
| 4.28827397214994 | 0.733 | 1.223 | 3.692 |
| 4.29141556480353 | 0.733 | 1.223 | 3.706 |
| 4.294557157457119 | 0.732 | 1.224 | 3.72 |
| 4.29769875011071 | 0.732 | 1.224 | 3.734 |
| 4.300840342764299 | 0.732 | 1.224 | 3.748 |
| 4.303981935417888 | 0.731 | 1.225 | 3.762 |
| 4.307123528071478 | 0.731 | 1.225 | 3.776 |
| 4.310265120725067 | 0.731 | 1.226 | 3.791 |
| 4.313406713378657 | 0.731 | 1.226 | 3.805 |
| 4.316548306032247 | 0.73 | 1.226 | 3.819 |
| 4.319689898685836 | 0.73 | 1.227 | 3.833 |
| 4.322831491339426 | 0.73 | 1.227 | 3.847 |
| 4.325973083993015 | 0.73 | 1.227 | 3.861 |
| 4.329114676646605 | 0.729 | 1.228 | 3.875 |
| 4.332256269300195 | 0.729 | 1.228 | 3.889 |
| 4.335397861953784 | 0.729 | 1.228 | 3.904 |
| 4.338539454607374 | 0.729 | 1.229 | 3.918 |
| 4.341681047260963 | 0.728 | 1.229 | 3.932 |
| 4.344822639914553 | 0.728 | 1.229 | 3.946 |
| 4.347964232568143 | 0.728 | 1.23 | 3.96 |
| 4.351105825221732 | 0.728 | 1.23 | 3.974 |
| 4.354247417875322 | 0.727 | 1.23 | 3.988 |
| 4.357389010528911 | 0.727 | 1.231 | 4.002 |
| 4.360530603182501 | 0.727 | 1.231 | 4.016 |
| 4.36367219583609 | 0.727 | 1.231 | 4.03 |
| 4.36681378848968 | 0.727 | 1.232 | 4.044 |
| 4.36995538114327 | 0.726 | 1.232 | 4.058 |
| 4.373096973796859 | 0.726 | 1.232 | 4.072 |
| 4.376238566450449 | 0.726 | 1.233 | 4.085 |
| 4.379380159104038 | 0.726 | 1.233 | 4.099 |
| 4.382521751757628 | 0.725 | 1.233 | 4.113 |
| 4.385663344411217 | 0.725 | 1.234 | 4.127 |
| 4.388804937064807 | 0.725 | 1.234 | 4.14 |
| 4.391946529718397 | 0.725 | 1.234 | 4.154 |
| 4.395088122371987 | 0.725 | 1.235 | 4.168 |
| 4.398229715025576 | 0.724 | 1.235 | 4.181 |
| 4.401371307679165 | 0.724 | 1.235 | 4.195 |
| 4.404512900332755 | 0.724 | 1.235 | 4.208 |
| 4.407654492986345 | 0.724 | 1.236 | 4.222 |
| 4.410796085639934 | 0.724 | 1.236 | 4.235 |
| 4.413937678293524 | 0.723 | 1.236 | 4.249 |
| 4.417079270947114 | 0.723 | 1.237 | 4.262 |
| 4.420220863600703 | 0.723 | 1.237 | 4.275 |
| 4.423362456254293 | 0.723 | 1.237 | 4.288 |
| 4.426504048907883 | 0.723 | 1.237 | 4.302 |
| 4.429645641561472 | 0.722 | 1.238 | 4.315 |
| 4.432787234215062 | 0.722 | 1.238 | 4.328 |
| 4.435928826868651 | 0.722 | 1.238 | 4.341 |
| 4.43907041952224 | 0.722 | 1.239 | 4.354 |
| 4.44221201217583 | 0.722 | 1.239 | 4.366 |
| 4.44535360482942 | 0.722 | 1.239 | 4.379 |
| 4.44849519748301 | 0.721 | 1.239 | 4.392 |
| 4.4516367901366 | 0.721 | 1.24 | 4.404 |
| 4.454778382790188 | 0.721 | 1.24 | 4.417 |
| 4.457919975443779 | 0.721 | 1.24 | 4.429 |
| 4.461061568097368 | 0.721 | 1.24 | 4.442 |
| 4.464203160750958 | 0.721 | 1.24 | 4.454 |
| 4.467344753404547 | 0.72 | 1.241 | 4.466 |
| 4.470486346058137 | 0.72 | 1.241 | 4.478 |
| 4.473627938711726 | 0.72 | 1.241 | 4.49 |
| 4.476769531365316 | 0.72 | 1.241 | 4.502 |
| 4.479911124018905 | 0.72 | 1.242 | 4.514 |
| 4.483052716672495 | 0.72 | 1.242 | 4.526 |
| 4.486194309326085 | 0.72 | 1.242 | 4.538 |
| 4.489335901979674 | 0.719 | 1.242 | 4.549 |
| 4.492477494633264 | 0.719 | 1.243 | 4.561 |
| 4.495619087286854 | 0.719 | 1.243 | 4.572 |
| 4.498760679940443 | 0.719 | 1.243 | 4.583 |
| 4.501902272594033 | 0.719 | 1.243 | 4.594 |
| 4.505043865247622 | 0.719 | 1.243 | 4.605 |
| 4.508185457901212 | 0.719 | 1.244 | 4.616 |
| 4.511327050554801 | 0.718 | 1.244 | 4.627 |
| 4.514468643208391 | 0.718 | 1.244 | 4.638 |
| 4.517610235861981 | 0.718 | 1.244 | 4.648 |
| 4.520751828515571 | 0.718 | 1.244 | 4.659 |
| 4.52389342116916 | 0.718 | 1.244 | 4.669 |
| 4.52703501382275 | 0.718 | 1.245 | 4.679 |
| 4.530176606476339 | 0.718 | 1.245 | 4.689 |
| 4.533318199129928 | 0.718 | 1.245 | 4.699 |
| 4.536459791783518 | 0.717 | 1.245 | 4.709 |
| 4.539601384437108 | 0.717 | 1.245 | 4.719 |
| 4.542742977090698 | 0.717 | 1.246 | 4.728 |
| 4.545884569744287 | 0.717 | 1.246 | 4.738 |
| 4.549026162397876 | 0.717 | 1.246 | 4.747 |
| 4.552167755051466 | 0.717 | 1.246 | 4.756 |
| 4.555309347705056 | 0.717 | 1.246 | 4.765 |
| 4.558450940358646 | 0.717 | 1.246 | 4.774 |
| 4.561592533012235 | 0.717 | 1.246 | 4.783 |
| 4.564734125665825 | 0.717 | 1.247 | 4.791 |
| 4.567875718319415 | 0.716 | 1.247 | 4.8 |
| 4.571017310973004 | 0.716 | 1.247 | 4.808 |
| 4.574158903626594 | 0.716 | 1.247 | 4.816 |
| 4.577300496280183 | 0.716 | 1.247 | 4.824 |
| 4.580442088933772 | 0.716 | 1.247 | 4.832 |
| 4.583583681587362 | 0.716 | 1.247 | 4.84 |
| 4.586725274240952 | 0.716 | 1.248 | 4.847 |
| 4.589866866894542 | 0.716 | 1.248 | 4.854 |
| 4.593008459548131 | 0.716 | 1.248 | 4.862 |
| 4.596150052201721 | 0.716 | 1.248 | 4.869 |
| 4.59929164485531 | 0.716 | 1.248 | 4.875 |
| 4.6024332375089 | 0.716 | 1.248 | 4.882 |
| 4.60557483016249 | 0.715 | 1.248 | 4.889 |
| 4.608716422816079 | 0.715 | 1.248 | 4.895 |
| 4.611858015469668 | 0.715 | 1.248 | 4.901 |
| 4.614999608123258 | 0.715 | 1.249 | 4.907 |
| 4.618141200776848 | 0.715 | 1.249 | 4.913 |
| 4.621282793430437 | 0.715 | 1.249 | 4.918 |
| 4.624424386084027 | 0.715 | 1.249 | 4.924 |
| 4.627565978737617 | 0.715 | 1.249 | 4.929 |
| 4.630707571391206 | 0.715 | 1.249 | 4.934 |
| 4.633849164044795 | 0.715 | 1.249 | 4.939 |
| 4.636990756698386 | 0.715 | 1.249 | 4.944 |
| 4.640132349351975 | 0.715 | 1.249 | 4.948 |
| 4.643273942005564 | 0.715 | 1.249 | 4.953 |
| 4.646415534659154 | 0.715 | 1.249 | 4.957 |
| 4.649557127312744 | 0.715 | 1.249 | 4.961 |
| 4.652698719966334 | 0.715 | 1.249 | 4.965 |
| 4.655840312619923 | 0.715 | 1.25 | 4.968 |
| 4.658981905273513 | 0.715 | 1.25 | 4.972 |
| 4.662123497927102 | 0.715 | 1.25 | 4.975 |
| 4.665265090580692 | 0.715 | 1.25 | 4.978 |
| 4.668406683234282 | 0.714 | 1.25 | 4.981 |
| 4.671548275887871 | 0.714 | 1.25 | 4.983 |
| 4.674689868541461 | 0.714 | 1.25 | 4.986 |
| 4.67783146119505 | 0.714 | 1.25 | 4.988 |
| 4.68097305384864 | 0.714 | 1.25 | 4.99 |
| 4.68411464650223 | 0.714 | 1.25 | 4.992 |
| 4.687256239155819 | 0.714 | 1.25 | 4.994 |
| 4.690397831809409 | 0.714 | 1.25 | 4.995 |
| 4.693539424462998 | 0.714 | 1.25 | 4.996 |
| 4.696681017116588 | 0.714 | 1.25 | 4.998 |
| 4.699822609770177 | 0.714 | 1.25 | 4.998 |
| 4.702964202423767 | 0.714 | 1.25 | 4.999 |
| 4.706105795077356 | 0.714 | 1.25 | 5 |
| 4.709247387730946 | 0.714 | 1.25 | 5 |
| 4.712388980384535 | 0.714 | 1.25 | 5 |
| 4.715530573038126 | 0.714 | 1.25 | 5 |
| 4.718672165691715 | 0.714 | 1.25 | 5 |
| 4.721813758345305 | 0.714 | 1.25 | 4.999 |
| 4.724955350998894 | 0.714 | 1.25 | 4.998 |
| 4.728096943652484 | 0.714 | 1.25 | 4.998 |
| 4.731238536306074 | 0.714 | 1.25 | 4.996 |
| 4.734380128959663 | 0.714 | 1.25 | 4.995 |
| 4.737521721613253 | 0.714 | 1.25 | 4.994 |
| 4.740663314266842 | 0.714 | 1.25 | 4.992 |
| 4.743804906920432 | 0.714 | 1.25 | 4.99 |
| 4.74694649957402 | 0.714 | 1.25 | 4.988 |
| 4.750088092227611 | 0.714 | 1.25 | 4.986 |
| 4.7532296848812 | 0.714 | 1.25 | 4.983 |
| 4.75637127753479 | 0.714 | 1.25 | 4.981 |
| 4.75951287018838 | 0.715 | 1.25 | 4.978 |
| 4.76265446284197 | 0.715 | 1.25 | 4.975 |
| 4.765796055495559 | 0.715 | 1.25 | 4.972 |
| 4.768937648149149 | 0.715 | 1.25 | 4.968 |
| 4.772079240802738 | 0.715 | 1.249 | 4.965 |
| 4.775220833456327 | 0.715 | 1.249 | 4.961 |
| 4.778362426109917 | 0.715 | 1.249 | 4.957 |
| 4.781504018763507 | 0.715 | 1.249 | 4.953 |
| 4.784645611417097 | 0.715 | 1.249 | 4.948 |
| 4.787787204070686 | 0.715 | 1.249 | 4.944 |
| 4.790928796724275 | 0.715 | 1.249 | 4.939 |
| 4.794070389377865 | 0.715 | 1.249 | 4.934 |
| 4.797211982031455 | 0.715 | 1.249 | 4.929 |
| 4.800353574685045 | 0.715 | 1.249 | 4.924 |
| 4.803495167338634 | 0.715 | 1.249 | 4.918 |
| 4.806636759992224 | 0.715 | 1.249 | 4.913 |
| 4.809778352645814 | 0.715 | 1.249 | 4.907 |
| 4.812919945299403 | 0.715 | 1.248 | 4.901 |
| 4.816061537952993 | 0.715 | 1.248 | 4.895 |
| 4.819203130606582 | 0.715 | 1.248 | 4.889 |
| 4.822344723260172 | 0.716 | 1.248 | 4.882 |
| 4.825486315913761 | 0.716 | 1.248 | 4.875 |
| 4.828627908567351 | 0.716 | 1.248 | 4.869 |
| 4.83176950122094 | 0.716 | 1.248 | 4.862 |
| 4.83491109387453 | 0.716 | 1.248 | 4.854 |
| 4.83805268652812 | 0.716 | 1.248 | 4.847 |
| 4.841194279181709 | 0.716 | 1.247 | 4.84 |
| 4.844335871835299 | 0.716 | 1.247 | 4.832 |
| 4.847477464488889 | 0.716 | 1.247 | 4.824 |
| 4.850619057142478 | 0.716 | 1.247 | 4.816 |
| 4.853760649796068 | 0.716 | 1.247 | 4.808 |
| 4.856902242449657 | 0.716 | 1.247 | 4.8 |
| 4.860043835103247 | 0.717 | 1.247 | 4.791 |
| 4.863185427756837 | 0.717 | 1.246 | 4.783 |
| 4.866327020410426 | 0.717 | 1.246 | 4.774 |
| 4.869468613064015 | 0.717 | 1.246 | 4.765 |
| 4.872610205717605 | 0.717 | 1.246 | 4.756 |
| 4.875751798371195 | 0.717 | 1.246 | 4.747 |
| 4.878893391024784 | 0.717 | 1.246 | 4.738 |
| 4.882034983678374 | 0.717 | 1.246 | 4.728 |
| 4.885176576331964 | 0.717 | 1.245 | 4.719 |
| 4.888318168985553 | 0.717 | 1.245 | 4.709 |
| 4.891459761639143 | 0.718 | 1.245 | 4.699 |
| 4.894601354292733 | 0.718 | 1.245 | 4.689 |
| 4.897742946946322 | 0.718 | 1.245 | 4.679 |
| 4.900884539599912 | 0.718 | 1.244 | 4.669 |
| 4.904026132253501 | 0.718 | 1.244 | 4.659 |
| 4.907167724907091 | 0.718 | 1.244 | 4.648 |
| 4.91030931756068 | 0.718 | 1.244 | 4.638 |
| 4.91345091021427 | 0.718 | 1.244 | 4.627 |
| 4.91659250286786 | 0.719 | 1.244 | 4.616 |
| 4.91973409552145 | 0.719 | 1.243 | 4.605 |
| 4.922875688175039 | 0.719 | 1.243 | 4.594 |
| 4.926017280828628 | 0.719 | 1.243 | 4.583 |
| 4.929158873482218 | 0.719 | 1.243 | 4.572 |
| 4.932300466135808 | 0.719 | 1.243 | 4.561 |
| 4.935442058789397 | 0.719 | 1.242 | 4.549 |
| 4.938583651442987 | 0.72 | 1.242 | 4.538 |
| 4.941725244096576 | 0.72 | 1.242 | 4.526 |
| 4.944866836750166 | 0.72 | 1.242 | 4.514 |
| 4.948008429403755 | 0.72 | 1.241 | 4.502 |
| 4.951150022057345 | 0.72 | 1.241 | 4.49 |
| 4.954291614710935 | 0.72 | 1.241 | 4.478 |
| 4.957433207364524 | 0.72 | 1.241 | 4.466 |
| 4.960574800018114 | 0.721 | 1.24 | 4.454 |
| 4.963716392671704 | 0.721 | 1.24 | 4.442 |
| 4.966857985325293 | 0.721 | 1.24 | 4.429 |
| 4.969999577978883 | 0.721 | 1.24 | 4.417 |
| 4.973141170632472 | 0.721 | 1.24 | 4.404 |
| 4.976282763286062 | 0.721 | 1.239 | 4.392 |
| 4.979424355939651 | 0.722 | 1.239 | 4.379 |
| 4.982565948593241 | 0.722 | 1.239 | 4.366 |
| 4.985707541246831 | 0.722 | 1.239 | 4.354 |
| 4.98884913390042 | 0.722 | 1.238 | 4.341 |
| 4.99199072655401 | 0.722 | 1.238 | 4.328 |
| 4.9951323192076 | 0.722 | 1.238 | 4.315 |
| 4.99827391186119 | 0.723 | 1.237 | 4.302 |
| 5.00141550451478 | 0.723 | 1.237 | 4.288 |
| 5.004557097168369 | 0.723 | 1.237 | 4.275 |
| 5.007698689821958 | 0.723 | 1.237 | 4.262 |
| 5.010840282475548 | 0.723 | 1.236 | 4.249 |
| 5.013981875129137 | 0.724 | 1.236 | 4.235 |
| 5.017123467782727 | 0.724 | 1.236 | 4.222 |
| 5.020265060436317 | 0.724 | 1.235 | 4.208 |
| 5.023406653089906 | 0.724 | 1.235 | 4.195 |
| 5.026548245743496 | 0.724 | 1.235 | 4.181 |
| 5.029689838397085 | 0.725 | 1.235 | 4.168 |
| 5.032831431050674 | 0.725 | 1.234 | 4.154 |
| 5.035973023704264 | 0.725 | 1.234 | 4.14 |
| 5.039114616357854 | 0.725 | 1.234 | 4.127 |
| 5.042256209011444 | 0.725 | 1.233 | 4.113 |
| 5.045397801665033 | 0.726 | 1.233 | 4.099 |
| 5.048539394318622 | 0.726 | 1.233 | 4.085 |
| 5.051680986972213 | 0.726 | 1.232 | 4.072 |
| 5.054822579625802 | 0.726 | 1.232 | 4.058 |
| 5.057964172279392 | 0.727 | 1.232 | 4.044 |
| 5.061105764932981 | 0.727 | 1.231 | 4.03 |
| 5.064247357586571 | 0.727 | 1.231 | 4.016 |
| 5.067388950240161 | 0.727 | 1.231 | 4.002 |
| 5.07053054289375 | 0.727 | 1.23 | 3.988 |
| 5.07367213554734 | 0.728 | 1.23 | 3.974 |
| 5.07681372820093 | 0.728 | 1.23 | 3.96 |
| 5.079955320854519 | 0.728 | 1.229 | 3.946 |
| 5.083096913508108 | 0.728 | 1.229 | 3.932 |
| 5.086238506161698 | 0.729 | 1.229 | 3.918 |
| 5.089380098815288 | 0.729 | 1.228 | 3.904 |
| 5.092521691468877 | 0.729 | 1.228 | 3.889 |
| 5.095663284122466 | 0.729 | 1.228 | 3.875 |
| 5.098804876776057 | 0.73 | 1.227 | 3.861 |
| 5.101946469429646 | 0.73 | 1.227 | 3.847 |
| 5.105088062083236 | 0.73 | 1.227 | 3.833 |
| 5.108229654736825 | 0.73 | 1.226 | 3.819 |
| 5.111371247390415 | 0.731 | 1.226 | 3.805 |
| 5.114512840044005 | 0.731 | 1.226 | 3.791 |
| 5.117654432697594 | 0.731 | 1.225 | 3.776 |
| 5.120796025351184 | 0.731 | 1.225 | 3.762 |
| 5.123937618004773 | 0.732 | 1.224 | 3.748 |
| 5.127079210658363 | 0.732 | 1.224 | 3.734 |
| 5.130220803311953 | 0.732 | 1.224 | 3.72 |
| 5.133362395965542 | 0.733 | 1.223 | 3.706 |
| 5.136503988619131 | 0.733 | 1.223 | 3.692 |
| 5.13964558127272 | 0.733 | 1.223 | 3.678 |
| 5.142787173926311 | 0.733 | 1.222 | 3.664 |
| 5.1459287665799 | 0.734 | 1.222 | 3.649 |
| 5.14907035923349 | 0.734 | 1.221 | 3.635 |
| 5.15221195188708 | 0.734 | 1.221 | 3.621 |
| 5.15535354454067 | 0.735 | 1.221 | 3.607 |
| 5.158495137194259 | 0.735 | 1.22 | 3.593 |
| 5.161636729847848 | 0.735 | 1.22 | 3.579 |
| 5.164778322501438 | 0.735 | 1.219 | 3.565 |
| 5.167919915155028 | 0.736 | 1.219 | 3.551 |
| 5.171061507808617 | 0.736 | 1.219 | 3.537 |
| 5.174203100462206 | 0.736 | 1.218 | 3.524 |
| 5.177344693115796 | 0.737 | 1.218 | 3.51 |
| 5.180486285769386 | 0.737 | 1.217 | 3.496 |
| 5.183627878422976 | 0.737 | 1.217 | 3.482 |
| 5.186769471076565 | 0.738 | 1.216 | 3.468 |
| 5.189911063730155 | 0.738 | 1.216 | 3.454 |
| 5.193052656383744 | 0.738 | 1.216 | 3.441 |
| 5.196194249037334 | 0.739 | 1.215 | 3.427 |
| 5.199335841690924 | 0.739 | 1.215 | 3.413 |
| 5.202477434344513 | 0.739 | 1.214 | 3.399 |
| 5.205619026998103 | 0.739 | 1.214 | 3.386 |
| 5.208760619651692 | 0.74 | 1.213 | 3.372 |
| 5.211902212305282 | 0.74 | 1.213 | 3.359 |
| 5.215043804958871 | 0.74 | 1.213 | 3.345 |
| 5.218185397612461 | 0.741 | 1.212 | 3.331 |
| 5.221326990266051 | 0.741 | 1.212 | 3.318 |
| 5.22446858291964 | 0.741 | 1.211 | 3.304 |
| 5.22761017557323 | 0.742 | 1.211 | 3.291 |
| 5.23075176822682 | 0.742 | 1.21 | 3.278 |
| 5.23389336088041 | 0.742 | 1.21 | 3.264 |
| 5.237034953533999 | 0.743 | 1.209 | 3.251 |
| 5.240176546187588 | 0.743 | 1.209 | 3.238 |
| 5.243318138841178 | 0.744 | 1.208 | 3.224 |
| 5.246459731494767 | 0.744 | 1.208 | 3.211 |
| 5.249601324148357 | 0.744 | 1.207 | 3.198 |
| 5.252742916801947 | 0.745 | 1.207 | 3.185 |
| 5.255884509455536 | 0.745 | 1.207 | 3.172 |
| 5.259026102109125 | 0.745 | 1.206 | 3.159 |
| 5.262167694762715 | 0.746 | 1.206 | 3.146 |
| 5.265309287416305 | 0.746 | 1.205 | 3.133 |
| 5.268450880069895 | 0.746 | 1.205 | 3.12 |
| 5.271592472723484 | 0.747 | 1.204 | 3.107 |
| 5.274734065377074 | 0.747 | 1.204 | 3.094 |
| 5.277875658030664 | 0.748 | 1.203 | 3.081 |
| 5.281017250684253 | 0.748 | 1.203 | 3.069 |
| 5.284158843337843 | 0.748 | 1.202 | 3.056 |
| 5.287300435991432 | 0.749 | 1.202 | 3.043 |
| 5.290442028645022 | 0.749 | 1.201 | 3.031 |
| 5.293583621298612 | 0.749 | 1.201 | 3.018 |
| 5.296725213952201 | 0.75 | 1.2 | 3.005 |
| 5.299866806605791 | 0.75 | 1.2 | 2.993 |
| 5.30300839925938 | 0.751 | 1.199 | 2.98 |
| 5.30614999191297 | 0.751 | 1.199 | 2.968 |
| 5.30929158456656 | 0.751 | 1.198 | 2.956 |
| 5.312433177220149 | 0.752 | 1.198 | 2.943 |
| 5.315574769873739 | 0.752 | 1.197 | 2.931 |
| 5.318716362527328 | 0.753 | 1.197 | 2.919 |
| 5.321857955180918 | 0.753 | 1.196 | 2.907 |
| 5.324999547834508 | 0.753 | 1.196 | 2.895 |
| 5.328141140488097 | 0.754 | 1.195 | 2.882 |
| 5.331282733141686 | 0.754 | 1.195 | 2.87 |
| 5.334424325795276 | 0.755 | 1.194 | 2.858 |
| 5.337565918448866 | 0.755 | 1.194 | 2.846 |
| 5.340707511102456 | 0.756 | 1.193 | 2.835 |
| 5.343849103756045 | 0.756 | 1.193 | 2.823 |
| 5.346990696409634 | 0.756 | 1.192 | 2.811 |
| 5.350132289063224 | 0.757 | 1.191 | 2.799 |
| 5.353273881716814 | 0.757 | 1.191 | 2.787 |
| 5.356415474370403 | 0.758 | 1.19 | 2.776 |
| 5.359557067023993 | 0.758 | 1.19 | 2.764 |
| 5.362698659677583 | 0.759 | 1.189 | 2.753 |
| 5.365840252331172 | 0.759 | 1.189 | 2.741 |
| 5.368981844984762 | 0.759 | 1.188 | 2.73 |
| 5.372123437638351 | 0.76 | 1.188 | 2.718 |
| 5.375265030291941 | 0.76 | 1.187 | 2.707 |
| 5.378406622945531 | 0.761 | 1.187 | 2.696 |
| 5.38154821559912 | 0.761 | 1.186 | 2.684 |
| 5.38468980825271 | 0.762 | 1.186 | 2.673 |
| 5.387831400906299 | 0.762 | 1.185 | 2.662 |
| 5.39097299355989 | 0.763 | 1.184 | 2.651 |
| 5.394114586213479 | 0.763 | 1.184 | 2.64 |
| 5.397256178867068 | 0.763 | 1.183 | 2.629 |
| 5.400397771520657 | 0.764 | 1.183 | 2.618 |
| 5.403539364174247 | 0.764 | 1.182 | 2.607 |
| 5.406680956827837 | 0.765 | 1.182 | 2.596 |
| 5.409822549481426 | 0.765 | 1.181 | 2.585 |
| 5.412964142135016 | 0.766 | 1.18 | 2.575 |
| 5.416105734788605 | 0.766 | 1.18 | 2.564 |
| 5.419247327442195 | 0.767 | 1.179 | 2.553 |
| 5.422388920095785 | 0.767 | 1.179 | 2.543 |
| 5.425530512749375 | 0.768 | 1.178 | 2.532 |
| 5.428672105402964 | 0.768 | 1.178 | 2.521 |
| 5.431813698056554 | 0.769 | 1.177 | 2.511 |
| 5.434955290710143 | 0.769 | 1.177 | 2.501 |
| 5.438096883363733 | 0.77 | 1.176 | 2.49 |
| 5.441238476017322 | 0.77 | 1.175 | 2.48 |
| 5.444380068670912 | 0.771 | 1.175 | 2.47 |
| 5.447521661324502 | 0.771 | 1.174 | 2.459 |
| 5.450663253978091 | 0.772 | 1.174 | 2.449 |
| 5.453804846631681 | 0.772 | 1.173 | 2.439 |
| 5.456946439285271 | 0.773 | 1.172 | 2.429 |
| 5.46008803193886 | 0.773 | 1.172 | 2.419 |
| 5.46322962459245 | 0.774 | 1.171 | 2.409 |
| 5.466371217246039 | 0.774 | 1.171 | 2.399 |
| 5.46951280989963 | 0.775 | 1.17 | 2.389 |
| 5.472654402553218 | 0.775 | 1.169 | 2.379 |
| 5.475795995206808 | 0.776 | 1.169 | 2.37 |
| 5.478937587860398 | 0.776 | 1.168 | 2.36 |
| 5.482079180513987 | 0.777 | 1.168 | 2.35 |
| 5.485220773167577 | 0.777 | 1.167 | 2.341 |
| 5.488362365821166 | 0.778 | 1.167 | 2.331 |
| 5.491503958474756 | 0.778 | 1.166 | 2.321 |
| 5.494645551128346 | 0.779 | 1.165 | 2.312 |
| 5.497787143781935 | 0.78 | 1.165 | 2.302 |
| 5.500928736435525 | 0.78 | 1.164 | 2.293 |
| 5.504070329089115 | 0.781 | 1.164 | 2.284 |
| 5.507211921742704 | 0.781 | 1.163 | 2.274 |
| 5.510353514396294 | 0.782 | 1.162 | 2.265 |
| 5.513495107049883 | 0.782 | 1.162 | 2.256 |
| 5.516636699703473 | 0.783 | 1.161 | 2.247 |
| 5.519778292357062 | 0.783 | 1.16 | 2.238 |
| 5.522919885010652 | 0.784 | 1.16 | 2.229 |
| 5.526061477664242 | 0.784 | 1.159 | 2.22 |
| 5.529203070317831 | 0.785 | 1.159 | 2.211 |
| 5.532344662971421 | 0.786 | 1.158 | 2.202 |
| 5.535486255625011 | 0.786 | 1.157 | 2.193 |
| 5.5386278482786 | 0.787 | 1.157 | 2.184 |
| 5.54176944093219 | 0.787 | 1.156 | 2.175 |
| 5.544911033585779 | 0.788 | 1.156 | 2.166 |
| 5.54805262623937 | 0.788 | 1.155 | 2.158 |
| 5.551194218892959 | 0.789 | 1.154 | 2.149 |
| 5.554335811546548 | 0.79 | 1.154 | 2.14 |
| 5.557477404200137 | 0.79 | 1.153 | 2.132 |
| 5.560618996853727 | 0.791 | 1.152 | 2.123 |
| 5.563760589507317 | 0.791 | 1.152 | 2.115 |
| 5.566902182160906 | 0.792 | 1.151 | 2.106 |
| 5.570043774814496 | 0.793 | 1.151 | 2.098 |
| 5.573185367468086 | 0.793 | 1.15 | 2.09 |
| 5.576326960121675 | 0.794 | 1.149 | 2.081 |
| 5.579468552775264 | 0.794 | 1.149 | 2.073 |
| 5.582610145428854 | 0.795 | 1.148 | 2.065 |
| 5.585751738082444 | 0.796 | 1.147 | 2.057 |
| 5.588893330736034 | 0.796 | 1.147 | 2.049 |
| 5.592034923389623 | 0.797 | 1.146 | 2.041 |
| 5.595176516043213 | 0.797 | 1.145 | 2.033 |
| 5.598318108696803 | 0.798 | 1.145 | 2.025 |
| 5.601459701350392 | 0.799 | 1.144 | 2.017 |
| 5.604601294003982 | 0.799 | 1.144 | 2.009 |
| 5.607742886657571 | 0.8 | 1.143 | 2.001 |
| 5.610884479311161 | 0.801 | 1.142 | 1.993 |
| 5.61402607196475 | 0.801 | 1.142 | 1.985 |
| 5.61716766461834 | 0.802 | 1.141 | 1.977 |
| 5.62030925727193 | 0.802 | 1.14 | 1.97 |
| 5.623450849925519 | 0.803 | 1.14 | 1.962 |
| 5.626592442579109 | 0.804 | 1.139 | 1.954 |
| 5.629734035232698 | 0.804 | 1.138 | 1.947 |
| 5.632875627886288 | 0.805 | 1.138 | 1.939 |
| 5.636017220539878 | 0.806 | 1.137 | 1.932 |
| 5.639158813193467 | 0.806 | 1.136 | 1.924 |
| 5.642300405847057 | 0.807 | 1.136 | 1.917 |
| 5.645441998500646 | 0.808 | 1.135 | 1.91 |
| 5.648583591154236 | 0.808 | 1.135 | 1.902 |
| 5.651725183807825 | 0.809 | 1.134 | 1.895 |
| 5.654866776461415 | 0.81 | 1.133 | 1.888 |
| 5.658008369115005 | 0.81 | 1.133 | 1.88 |
| 5.661149961768594 | 0.811 | 1.132 | 1.873 |
| 5.664291554422184 | 0.812 | 1.131 | 1.866 |
| 5.667433147075774 | 0.812 | 1.131 | 1.859 |
| 5.670574739729363 | 0.813 | 1.13 | 1.852 |
| 5.673716332382953 | 0.814 | 1.129 | 1.845 |
| 5.676857925036542 | 0.814 | 1.129 | 1.838 |
| 5.679999517690132 | 0.815 | 1.128 | 1.831 |
| 5.683141110343721 | 0.816 | 1.127 | 1.824 |
| 5.686282702997311 | 0.816 | 1.127 | 1.817 |
| 5.689424295650901 | 0.817 | 1.126 | 1.81 |
| 5.69256588830449 | 0.818 | 1.125 | 1.803 |
| 5.69570748095808 | 0.819 | 1.125 | 1.797 |
| 5.69884907361167 | 0.819 | 1.124 | 1.79 |
| 5.701990666265259 | 0.82 | 1.123 | 1.783 |
| 5.705132258918849 | 0.821 | 1.123 | 1.777 |
| 5.708273851572438 | 0.821 | 1.122 | 1.77 |
| 5.711415444226028 | 0.822 | 1.121 | 1.763 |
| 5.714557036879618 | 0.823 | 1.121 | 1.757 |
| 5.717698629533207 | 0.823 | 1.12 | 1.75 |
| 5.720840222186797 | 0.824 | 1.119 | 1.744 |
| 5.723981814840386 | 0.825 | 1.119 | 1.737 |
| 5.727123407493976 | 0.826 | 1.118 | 1.731 |
| 5.730265000147565 | 0.826 | 1.117 | 1.725 |
| 5.733406592801155 | 0.827 | 1.117 | 1.718 |
| 5.736548185454744 | 0.828 | 1.116 | 1.712 |
| 5.739689778108334 | 0.829 | 1.115 | 1.706 |
| 5.742831370761924 | 0.829 | 1.115 | 1.699 |
| 5.745972963415514 | 0.83 | 1.114 | 1.693 |
| 5.749114556069103 | 0.831 | 1.113 | 1.687 |
| 5.752256148722693 | 0.832 | 1.113 | 1.681 |
| 5.755397741376282 | 0.832 | 1.112 | 1.675 |
| 5.758539334029872 | 0.833 | 1.111 | 1.669 |
| 5.761680926683462 | 0.834 | 1.111 | 1.663 |
| 5.764822519337051 | 0.835 | 1.11 | 1.657 |
| 5.767964111990641 | 0.835 | 1.109 | 1.651 |
| 5.77110570464423 | 0.836 | 1.109 | 1.645 |
| 5.77424729729782 | 0.837 | 1.108 | 1.639 |
| 5.77738888995141 | 0.838 | 1.107 | 1.633 |
| 5.780530482605 | 0.838 | 1.107 | 1.627 |
| 5.783672075258588 | 0.839 | 1.106 | 1.621 |
| 5.786813667912178 | 0.84 | 1.105 | 1.615 |
| 5.789955260565768 | 0.841 | 1.105 | 1.61 |
| 5.793096853219358 | 0.842 | 1.104 | 1.604 |
| 5.796238445872947 | 0.842 | 1.103 | 1.598 |
| 5.799380038526537 | 0.843 | 1.103 | 1.593 |
| 5.802521631180126 | 0.844 | 1.102 | 1.587 |
| 5.805663223833715 | 0.845 | 1.101 | 1.581 |
| 5.808804816487306 | 0.846 | 1.101 | 1.576 |
| 5.811946409140895 | 0.846 | 1.1 | 1.57 |
| 5.815088001794485 | 0.847 | 1.099 | 1.565 |
| 5.818229594448074 | 0.848 | 1.099 | 1.559 |
| 5.821371187101663 | 0.849 | 1.098 | 1.554 |
| 5.824512779755254 | 0.85 | 1.097 | 1.548 |
| 5.827654372408843 | 0.85 | 1.096 | 1.543 |
| 5.830795965062433 | 0.851 | 1.096 | 1.538 |
| 5.833937557716022 | 0.852 | 1.095 | 1.532 |
| 5.837079150369612 | 0.853 | 1.094 | 1.527 |
| 5.840220743023201 | 0.854 | 1.094 | 1.522 |
| 5.843362335676791 | 0.854 | 1.093 | 1.517 |
| 5.846503928330381 | 0.855 | 1.092 | 1.511 |
| 5.84964552098397 | 0.856 | 1.092 | 1.506 |
| 5.85278711363756 | 0.857 | 1.091 | 1.501 |
| 5.85592870629115 | 0.858 | 1.09 | 1.496 |
| 5.85907029894474 | 0.859 | 1.09 | 1.491 |
| 5.862211891598329 | 0.86 | 1.089 | 1.486 |
| 5.865353484251918 | 0.86 | 1.088 | 1.481 |
| 5.868495076905508 | 0.861 | 1.088 | 1.476 |
| 5.871636669559098 | 0.862 | 1.087 | 1.471 |
| 5.874778262212687 | 0.863 | 1.086 | 1.466 |
| 5.877919854866277 | 0.864 | 1.086 | 1.461 |
| 5.881061447519866 | 0.865 | 1.085 | 1.456 |
| 5.884203040173456 | 0.866 | 1.084 | 1.451 |
| 5.887344632827046 | 0.866 | 1.084 | 1.446 |
| 5.890486225480635 | 0.867 | 1.083 | 1.441 |
| 5.893627818134224 | 0.868 | 1.082 | 1.436 |
| 5.896769410787814 | 0.869 | 1.082 | 1.432 |
| 5.899911003441404 | 0.87 | 1.081 | 1.427 |
| 5.903052596094994 | 0.871 | 1.08 | 1.422 |
| 5.906194188748583 | 0.872 | 1.079 | 1.417 |
| 5.909335781402172 | 0.873 | 1.079 | 1.413 |
| 5.912477374055762 | 0.873 | 1.078 | 1.408 |
| 5.915618966709352 | 0.874 | 1.077 | 1.403 |
| 5.918760559362942 | 0.875 | 1.077 | 1.399 |
| 5.921902152016531 | 0.876 | 1.076 | 1.394 |
| 5.92504374467012 | 0.877 | 1.075 | 1.39 |
| 5.92818533732371 | 0.878 | 1.075 | 1.385 |
| 5.9313269299773 | 0.879 | 1.074 | 1.381 |
| 5.93446852263089 | 0.88 | 1.073 | 1.376 |
| 5.93761011528448 | 0.881 | 1.073 | 1.372 |
| 5.940751707938068 | 0.882 | 1.072 | 1.367 |
| 5.943893300591658 | 0.883 | 1.071 | 1.363 |
| 5.947034893245248 | 0.883 | 1.071 | 1.358 |
| 5.950176485898837 | 0.884 | 1.07 | 1.354 |
| 5.953318078552427 | 0.885 | 1.069 | 1.35 |
| 5.956459671206017 | 0.886 | 1.069 | 1.345 |
| 5.959601263859606 | 0.887 | 1.068 | 1.341 |
| 5.962742856513196 | 0.888 | 1.067 | 1.337 |
| 5.965884449166785 | 0.889 | 1.067 | 1.333 |
| 5.969026041820375 | 0.89 | 1.066 | 1.328 |
| 5.972167634473964 | 0.891 | 1.065 | 1.324 |
| 5.975309227127554 | 0.892 | 1.065 | 1.32 |
| 5.978450819781144 | 0.893 | 1.064 | 1.316 |
| 5.981592412434733 | 0.894 | 1.063 | 1.312 |
| 5.984734005088323 | 0.895 | 1.062 | 1.308 |
| 5.987875597741913 | 0.896 | 1.062 | 1.303 |
| 5.991017190395502 | 0.897 | 1.061 | 1.299 |
| 5.994158783049092 | 0.898 | 1.06 | 1.295 |
| 5.997300375702681 | 0.899 | 1.06 | 1.291 |
| 6.000441968356271 | 0.9 | 1.059 | 1.287 |
| 6.003583561009861 | 0.901 | 1.058 | 1.283 |
| 6.00672515366345 | 0.902 | 1.058 | 1.279 |
| 6.00986674631704 | 0.903 | 1.057 | 1.275 |
| 6.01300833897063 | 0.904 | 1.056 | 1.271 |
| 6.01614993162422 | 0.905 | 1.056 | 1.268 |
| 6.019291524277808 | 0.906 | 1.055 | 1.264 |
| 6.022433116931398 | 0.907 | 1.054 | 1.26 |
| 6.025574709584988 | 0.908 | 1.054 | 1.256 |
| 6.028716302238577 | 0.909 | 1.053 | 1.252 |
| 6.031857894892167 | 0.91 | 1.052 | 1.248 |
| 6.034999487545757 | 0.911 | 1.052 | 1.245 |
| 6.038141080199346 | 0.912 | 1.051 | 1.241 |
| 6.041282672852935 | 0.913 | 1.05 | 1.237 |
| 6.044424265506525 | 0.914 | 1.05 | 1.233 |
| 6.047565858160115 | 0.915 | 1.049 | 1.23 |
| 6.050707450813704 | 0.916 | 1.048 | 1.226 |
| 6.053849043467294 | 0.917 | 1.048 | 1.222 |
| 6.056990636120884 | 0.918 | 1.047 | 1.219 |
| 6.060132228774473 | 0.919 | 1.046 | 1.215 |
| 6.063273821428063 | 0.92 | 1.046 | 1.211 |
| 6.066415414081653 | 0.921 | 1.045 | 1.208 |
| 6.069557006735242 | 0.922 | 1.044 | 1.204 |
| 6.072698599388831 | 0.923 | 1.044 | 1.201 |
| 6.07584019204242 | 0.924 | 1.043 | 1.197 |
| 6.078981784696011 | 0.925 | 1.042 | 1.194 |
| 6.082123377349601 | 0.926 | 1.042 | 1.19 |
| 6.08526497000319 | 0.927 | 1.041 | 1.187 |
| 6.08840656265678 | 0.928 | 1.04 | 1.183 |
| 6.09154815531037 | 0.929 | 1.04 | 1.18 |
| 6.094689747963959 | 0.93 | 1.039 | 1.176 |
| 6.097831340617549 | 0.931 | 1.038 | 1.173 |
| 6.100972933271138 | 0.932 | 1.038 | 1.17 |
| 6.104114525924728 | 0.933 | 1.037 | 1.166 |
| 6.107256118578317 | 0.935 | 1.036 | 1.163 |
| 6.110397711231907 | 0.936 | 1.036 | 1.159 |
| 6.113539303885497 | 0.937 | 1.035 | 1.156 |
| 6.116680896539086 | 0.938 | 1.034 | 1.153 |
| 6.119822489192675 | 0.939 | 1.034 | 1.15 |
| 6.122964081846265 | 0.94 | 1.033 | 1.146 |
| 6.126105674499855 | 0.941 | 1.032 | 1.143 |
| 6.129247267153445 | 0.942 | 1.032 | 1.14 |
| 6.132388859807034 | 0.943 | 1.031 | 1.137 |
| 6.135530452460624 | 0.944 | 1.03 | 1.133 |
| 6.138672045114213 | 0.946 | 1.03 | 1.13 |
| 6.141813637767803 | 0.947 | 1.029 | 1.127 |
| 6.144955230421393 | 0.948 | 1.028 | 1.124 |
| 6.148096823074982 | 0.949 | 1.028 | 1.121 |
| 6.151238415728571 | 0.95 | 1.027 | 1.118 |
| 6.154380008382161 | 0.951 | 1.026 | 1.115 |
| 6.157521601035751 | 0.952 | 1.026 | 1.111 |
| 6.16066319368934 | 0.953 | 1.025 | 1.108 |
| 6.16380478634293 | 0.955 | 1.024 | 1.105 |
| 6.16694637899652 | 0.956 | 1.024 | 1.102 |
| 6.170087971650109 | 0.957 | 1.023 | 1.099 |
| 6.173229564303698 | 0.958 | 1.022 | 1.096 |
| 6.176371156957289 | 0.959 | 1.022 | 1.093 |
| 6.179512749610878 | 0.96 | 1.021 | 1.09 |
| 6.182654342264468 | 0.961 | 1.02 | 1.087 |
| 6.185795934918057 | 0.963 | 1.02 | 1.084 |
| 6.188937527571647 | 0.964 | 1.019 | 1.081 |
| 6.192079120225237 | 0.965 | 1.019 | 1.078 |
| 6.195220712878826 | 0.966 | 1.018 | 1.076 |
| 6.198362305532415 | 0.967 | 1.017 | 1.073 |
| 6.201503898186005 | 0.968 | 1.017 | 1.07 |
| 6.204645490839594 | 0.97 | 1.016 | 1.067 |
| 6.207787083493184 | 0.971 | 1.015 | 1.064 |
| 6.210928676146774 | 0.972 | 1.015 | 1.061 |
| 6.214070268800364 | 0.973 | 1.014 | 1.058 |
| 6.217211861453953 | 0.974 | 1.013 | 1.056 |
| 6.220353454107543 | 0.975 | 1.013 | 1.053 |
| 6.223495046761133 | 0.977 | 1.012 | 1.05 |
| 6.226636639414722 | 0.978 | 1.011 | 1.047 |
| 6.229778232068312 | 0.979 | 1.011 | 1.045 |
| 6.232919824721901 | 0.98 | 1.01 | 1.042 |
| 6.236061417375491 | 0.982 | 1.01 | 1.039 |
| 6.23920301002908 | 0.983 | 1.009 | 1.036 |
| 6.24234460268267 | 0.984 | 1.008 | 1.034 |
| 6.24548619533626 | 0.985 | 1.008 | 1.031 |
| 6.24862778798985 | 0.986 | 1.007 | 1.028 |
| 6.251769380643438 | 0.988 | 1.006 | 1.026 |
| 6.254910973297028 | 0.989 | 1.006 | 1.023 |
| 6.258052565950618 | 0.99 | 1.005 | 1.021 |
| 6.261194158604208 | 0.991 | 1.004 | 1.018 |
| 6.264335751257797 | 0.993 | 1.004 | 1.015 |
| 6.267477343911387 | 0.994 | 1.003 | 1.013 |
| 6.270618936564976 | 0.995 | 1.003 | 1.01 |
| 6.273760529218566 | 0.996 | 1.002 | 1.008 |
| 6.276902121872155 | 0.997 | 1.001 | 1.005 |
| 6.280043714525745 | 0.999 | 1.001 | 1.003 |
| 6.283185307179335 | 1 | 1 | 1 |